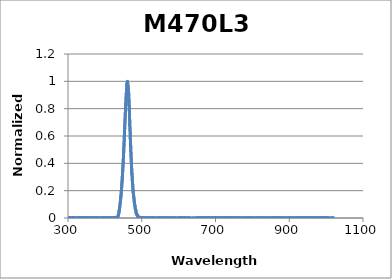
| Category | Normalized Intensity |
|---|---|
| 194.11 | 0.002 |
| 194.31 | -0.003 |
| 194.52 | 0 |
| 194.72 | -0.001 |
| 194.92 | 0.003 |
| 195.12 | 0.001 |
| 195.33 | 0.001 |
| 195.53 | -0.002 |
| 195.73 | -0.001 |
| 195.93 | 0.001 |
| 196.13 | 0.001 |
| 196.34 | 0.001 |
| 196.54 | -0.001 |
| 196.74 | 0.001 |
| 196.94 | 0 |
| 197.15 | 0.001 |
| 197.35 | 0.002 |
| 197.55 | -0.001 |
| 197.75 | -0.001 |
| 197.96 | 0 |
| 198.16 | 0.001 |
| 198.36 | 0 |
| 198.56 | 0 |
| 198.76 | 0.002 |
| 198.97 | 0.001 |
| 199.17 | -0.001 |
| 199.37 | 0.001 |
| 199.57 | 0 |
| 199.78 | 0.001 |
| 199.98 | -0.001 |
| 200.18 | -0.001 |
| 200.39 | 0 |
| 200.59 | 0.001 |
| 200.79 | 0 |
| 200.99 | -0.001 |
| 201.2 | -0.003 |
| 201.4 | 0.002 |
| 201.6 | -0.001 |
| 201.8 | 0 |
| 202.01 | -0.002 |
| 202.21 | -0.001 |
| 202.41 | -0.002 |
| 202.62 | -0.001 |
| 202.82 | -0.001 |
| 203.02 | -0.001 |
| 203.22 | -0.002 |
| 203.43 | 0 |
| 203.63 | -0.001 |
| 203.83 | 0 |
| 204.04 | -0.001 |
| 204.24 | 0 |
| 204.44 | -0.001 |
| 204.64 | 0.002 |
| 204.85 | -0.003 |
| 205.05 | 0.001 |
| 205.25 | -0.001 |
| 205.46 | 0 |
| 205.66 | 0 |
| 205.86 | 0.001 |
| 206.07 | 0 |
| 206.27 | 0.003 |
| 206.47 | -0.002 |
| 206.68 | -0.002 |
| 206.88 | 0 |
| 207.08 | 0.001 |
| 207.29 | 0 |
| 207.49 | -0.001 |
| 207.69 | -0.001 |
| 207.89 | 0 |
| 208.1 | -0.002 |
| 208.3 | 0 |
| 208.5 | -0.002 |
| 208.71 | 0.001 |
| 208.91 | 0 |
| 209.12 | 0.001 |
| 209.32 | -0.001 |
| 209.52 | -0.001 |
| 209.73 | 0 |
| 209.93 | 0.001 |
| 210.13 | 0 |
| 210.34 | 0 |
| 210.54 | -0.002 |
| 210.74 | 0.001 |
| 210.95 | -0.003 |
| 211.15 | -0.002 |
| 211.35 | -0.001 |
| 211.56 | 0.001 |
| 211.76 | -0.003 |
| 211.96 | -0.001 |
| 212.17 | -0.003 |
| 212.37 | -0.002 |
| 212.58 | 0 |
| 212.78 | -0.001 |
| 212.98 | -0.002 |
| 213.19 | -0.001 |
| 213.39 | -0.001 |
| 213.59 | 0.001 |
| 213.8 | -0.001 |
| 214.0 | -0.001 |
| 214.21 | 0 |
| 214.41 | -0.001 |
| 214.61 | -0.001 |
| 214.82 | 0.001 |
| 215.02 | -0.001 |
| 215.23 | 0.003 |
| 215.43 | 0.001 |
| 215.63 | -0.001 |
| 215.84 | 0 |
| 216.04 | 0.001 |
| 216.25 | -0.002 |
| 216.45 | -0.001 |
| 216.65 | -0.001 |
| 216.86 | 0 |
| 217.06 | 0.001 |
| 217.27 | -0.001 |
| 217.47 | -0.002 |
| 217.67 | 0.001 |
| 217.88 | -0.002 |
| 218.08 | 0 |
| 218.29 | -0.001 |
| 218.49 | -0.001 |
| 218.7 | 0 |
| 218.9 | 0.002 |
| 219.1 | -0.001 |
| 219.31 | -0.001 |
| 219.51 | 0 |
| 219.72 | 0 |
| 219.92 | -0.002 |
| 220.13 | 0.002 |
| 220.33 | 0 |
| 220.53 | -0.001 |
| 220.74 | -0.001 |
| 220.94 | -0.001 |
| 221.15 | -0.002 |
| 221.35 | 0 |
| 221.56 | -0.002 |
| 221.76 | 0 |
| 221.97 | -0.002 |
| 222.17 | 0.001 |
| 222.38 | -0.001 |
| 222.58 | 0 |
| 222.78 | 0.001 |
| 222.99 | 0.001 |
| 223.19 | -0.001 |
| 223.4 | -0.002 |
| 223.6 | -0.003 |
| 223.81 | 0.001 |
| 224.01 | -0.001 |
| 224.22 | 0 |
| 224.42 | 0.001 |
| 224.63 | -0.002 |
| 224.83 | -0.002 |
| 225.04 | 0 |
| 225.24 | -0.002 |
| 225.45 | 0 |
| 225.65 | -0.001 |
| 225.86 | 0 |
| 226.06 | -0.002 |
| 226.27 | 0.002 |
| 226.47 | -0.002 |
| 226.68 | 0.002 |
| 226.88 | 0 |
| 227.09 | -0.001 |
| 227.29 | -0.002 |
| 227.5 | -0.002 |
| 227.7 | 0 |
| 227.91 | 0.002 |
| 228.11 | -0.002 |
| 228.32 | -0.003 |
| 228.52 | -0.003 |
| 228.73 | 0 |
| 228.93 | -0.003 |
| 229.14 | 0.002 |
| 229.34 | 0 |
| 229.55 | 0.001 |
| 229.75 | -0.002 |
| 229.96 | 0 |
| 230.16 | -0.002 |
| 230.37 | 0 |
| 230.57 | -0.001 |
| 230.78 | 0.001 |
| 230.98 | -0.002 |
| 231.19 | 0 |
| 231.39 | 0.001 |
| 231.6 | -0.001 |
| 231.81 | -0.001 |
| 232.01 | -0.001 |
| 232.22 | 0.001 |
| 232.42 | 0 |
| 232.63 | 0 |
| 232.83 | 0.002 |
| 233.04 | 0 |
| 233.24 | 0 |
| 233.45 | 0 |
| 233.65 | 0 |
| 233.86 | -0.003 |
| 234.07 | -0.001 |
| 234.27 | -0.001 |
| 234.48 | 0 |
| 234.68 | 0 |
| 234.89 | 0.002 |
| 235.09 | 0.001 |
| 235.3 | 0.001 |
| 235.51 | -0.002 |
| 235.71 | -0.001 |
| 235.92 | 0 |
| 236.12 | 0 |
| 236.33 | -0.001 |
| 236.53 | -0.002 |
| 236.74 | -0.001 |
| 236.95 | 0.001 |
| 237.15 | 0 |
| 237.36 | -0.001 |
| 237.56 | 0.001 |
| 237.77 | -0.001 |
| 237.98 | -0.001 |
| 238.18 | 0 |
| 238.39 | -0.001 |
| 238.59 | 0 |
| 238.8 | -0.001 |
| 239.01 | 0.002 |
| 239.21 | 0 |
| 239.42 | 0 |
| 239.62 | 0 |
| 239.83 | 0.001 |
| 240.04 | 0.001 |
| 240.24 | 0.003 |
| 240.45 | 0.001 |
| 240.65 | 0 |
| 240.86 | 0 |
| 241.07 | 0.001 |
| 241.27 | -0.002 |
| 241.48 | 0 |
| 241.69 | -0.001 |
| 241.89 | 0 |
| 242.1 | -0.001 |
| 242.3 | 0 |
| 242.51 | 0.001 |
| 242.72 | 0 |
| 242.92 | -0.002 |
| 243.13 | 0.001 |
| 243.34 | -0.002 |
| 243.54 | 0 |
| 243.75 | 0 |
| 243.96 | -0.001 |
| 244.16 | -0.002 |
| 244.37 | 0 |
| 244.58 | 0.002 |
| 244.78 | 0.003 |
| 244.99 | -0.001 |
| 245.19 | 0.001 |
| 245.4 | 0.001 |
| 245.61 | -0.001 |
| 245.81 | -0.002 |
| 246.02 | 0 |
| 246.23 | 0.001 |
| 246.43 | 0 |
| 246.64 | 0 |
| 246.85 | -0.001 |
| 247.05 | -0.003 |
| 247.26 | 0.001 |
| 247.47 | -0.001 |
| 247.67 | -0.001 |
| 247.88 | 0 |
| 248.09 | 0.001 |
| 248.3 | 0 |
| 248.5 | 0 |
| 248.71 | -0.001 |
| 248.92 | 0.003 |
| 249.12 | -0.002 |
| 249.33 | -0.001 |
| 249.54 | -0.001 |
| 249.74 | 0.001 |
| 249.95 | 0.001 |
| 250.16 | 0.002 |
| 250.36 | -0.002 |
| 250.57 | 0.001 |
| 250.78 | -0.001 |
| 250.99 | 0.003 |
| 251.19 | -0.001 |
| 251.4 | 0 |
| 251.61 | -0.001 |
| 251.81 | 0.001 |
| 252.02 | -0.001 |
| 252.23 | -0.001 |
| 252.44 | 0 |
| 252.64 | 0.001 |
| 252.85 | -0.001 |
| 253.06 | 0 |
| 253.26 | 0.003 |
| 253.47 | 0.001 |
| 253.68 | 0 |
| 253.89 | 0.002 |
| 254.09 | -0.001 |
| 254.3 | 0.002 |
| 254.51 | -0.002 |
| 254.72 | 0.001 |
| 254.92 | -0.001 |
| 255.13 | -0.001 |
| 255.34 | 0.001 |
| 255.54 | 0.001 |
| 255.75 | -0.002 |
| 255.96 | 0.001 |
| 256.17 | 0.001 |
| 256.37 | 0.001 |
| 256.58 | -0.001 |
| 256.79 | -0.001 |
| 257.0 | -0.001 |
| 257.2 | -0.001 |
| 257.41 | -0.003 |
| 257.62 | -0.001 |
| 257.83 | -0.002 |
| 258.04 | -0.001 |
| 258.24 | -0.003 |
| 258.45 | 0.002 |
| 258.66 | -0.002 |
| 258.87 | 0 |
| 259.07 | 0 |
| 259.28 | 0.003 |
| 259.49 | -0.001 |
| 259.7 | 0.002 |
| 259.9 | 0 |
| 260.11 | -0.001 |
| 260.32 | 0 |
| 260.53 | 0 |
| 260.74 | -0.001 |
| 260.94 | 0.001 |
| 261.15 | -0.001 |
| 261.36 | 0.002 |
| 261.57 | -0.004 |
| 261.78 | 0 |
| 261.98 | -0.001 |
| 262.19 | 0.001 |
| 262.4 | 0 |
| 262.61 | 0.001 |
| 262.82 | -0.002 |
| 263.02 | 0 |
| 263.23 | -0.001 |
| 263.44 | 0.003 |
| 263.65 | -0.001 |
| 263.86 | -0.002 |
| 264.06 | -0.001 |
| 264.27 | 0.001 |
| 264.48 | 0 |
| 264.69 | 0.001 |
| 264.9 | 0 |
| 265.11 | 0 |
| 265.31 | 0.001 |
| 265.52 | -0.001 |
| 265.73 | -0.002 |
| 265.94 | 0 |
| 266.15 | 0 |
| 266.35 | -0.001 |
| 266.56 | -0.001 |
| 266.77 | 0.001 |
| 266.98 | -0.001 |
| 267.19 | 0 |
| 267.4 | -0.002 |
| 267.61 | 0 |
| 267.81 | 0 |
| 268.02 | 0 |
| 268.23 | -0.002 |
| 268.44 | 0.002 |
| 268.65 | 0.001 |
| 268.86 | 0.001 |
| 269.06 | -0.001 |
| 269.27 | -0.001 |
| 269.48 | -0.003 |
| 269.69 | 0.002 |
| 269.9 | -0.001 |
| 270.11 | 0.003 |
| 270.32 | -0.002 |
| 270.52 | 0 |
| 270.73 | 0.001 |
| 270.94 | 0 |
| 271.15 | 0.002 |
| 271.36 | 0 |
| 271.57 | 0 |
| 271.78 | -0.001 |
| 271.99 | 0.001 |
| 272.19 | 0 |
| 272.4 | 0 |
| 272.61 | -0.001 |
| 272.82 | -0.001 |
| 273.03 | 0 |
| 273.24 | 0 |
| 273.45 | 0.001 |
| 273.66 | -0.002 |
| 273.87 | -0.001 |
| 274.07 | -0.002 |
| 274.28 | -0.001 |
| 274.49 | -0.002 |
| 274.7 | -0.002 |
| 274.91 | 0 |
| 275.12 | -0.001 |
| 275.33 | -0.002 |
| 275.54 | 0.001 |
| 275.75 | -0.002 |
| 275.96 | -0.001 |
| 276.17 | -0.002 |
| 276.37 | 0 |
| 276.58 | -0.002 |
| 276.79 | 0.001 |
| 277.0 | -0.002 |
| 277.21 | 0.001 |
| 277.42 | -0.002 |
| 277.63 | 0 |
| 277.84 | -0.001 |
| 278.05 | 0.001 |
| 278.26 | 0.001 |
| 278.47 | 0.001 |
| 278.68 | 0 |
| 278.89 | 0.002 |
| 279.09 | -0.001 |
| 279.3 | -0.001 |
| 279.51 | 0.001 |
| 279.72 | 0 |
| 279.93 | 0 |
| 280.14 | 0 |
| 280.35 | 0 |
| 280.56 | 0 |
| 280.77 | 0.002 |
| 280.98 | 0 |
| 281.19 | 0 |
| 281.4 | -0.002 |
| 281.61 | 0.001 |
| 281.82 | 0.001 |
| 282.03 | -0.001 |
| 282.24 | -0.001 |
| 282.45 | 0 |
| 282.66 | 0.002 |
| 282.87 | -0.001 |
| 283.08 | -0.001 |
| 283.29 | 0.001 |
| 283.5 | 0.002 |
| 283.7 | -0.001 |
| 283.91 | -0.001 |
| 284.12 | 0.002 |
| 284.33 | 0.002 |
| 284.54 | 0 |
| 284.75 | -0.001 |
| 284.96 | 0.002 |
| 285.17 | 0.001 |
| 285.38 | -0.003 |
| 285.59 | 0.001 |
| 285.8 | -0.001 |
| 286.01 | 0.001 |
| 286.22 | 0 |
| 286.43 | 0 |
| 286.64 | 0 |
| 286.85 | 0.002 |
| 287.06 | -0.001 |
| 287.27 | -0.001 |
| 287.48 | 0.001 |
| 287.69 | 0.001 |
| 287.9 | 0 |
| 288.11 | 0.001 |
| 288.32 | -0.002 |
| 288.53 | 0 |
| 288.74 | 0 |
| 288.95 | 0.001 |
| 289.16 | 0.002 |
| 289.37 | 0 |
| 289.58 | -0.001 |
| 289.79 | 0.001 |
| 290.0 | -0.001 |
| 290.21 | 0 |
| 290.43 | -0.001 |
| 290.64 | -0.001 |
| 290.85 | -0.002 |
| 291.06 | -0.002 |
| 291.27 | -0.001 |
| 291.48 | 0.001 |
| 291.69 | 0 |
| 291.9 | 0 |
| 292.11 | -0.003 |
| 292.32 | 0 |
| 292.53 | -0.001 |
| 292.74 | 0.002 |
| 292.95 | 0 |
| 293.16 | 0.002 |
| 293.37 | 0 |
| 293.58 | 0.002 |
| 293.79 | -0.001 |
| 294.0 | 0 |
| 294.21 | -0.001 |
| 294.42 | 0 |
| 294.63 | 0 |
| 294.84 | 0.001 |
| 295.06 | -0.002 |
| 295.27 | 0 |
| 295.48 | -0.001 |
| 295.69 | -0.001 |
| 295.9 | 0.002 |
| 296.11 | 0 |
| 296.32 | -0.001 |
| 296.53 | -0.001 |
| 296.74 | -0.001 |
| 296.95 | 0.001 |
| 297.16 | -0.003 |
| 297.37 | -0.002 |
| 297.58 | -0.001 |
| 297.79 | -0.001 |
| 298.01 | -0.001 |
| 298.22 | 0 |
| 298.43 | -0.002 |
| 298.64 | 0 |
| 298.85 | -0.001 |
| 299.06 | 0.003 |
| 299.27 | 0 |
| 299.48 | 0.001 |
| 299.69 | -0.001 |
| 299.9 | 0 |
| 300.12 | -0.003 |
| 300.33 | 0.002 |
| 300.54 | -0.001 |
| 300.75 | -0.002 |
| 300.96 | 0.001 |
| 301.17 | 0.002 |
| 301.38 | 0.001 |
| 301.59 | 0.002 |
| 301.8 | -0.003 |
| 302.02 | 0.001 |
| 302.23 | 0 |
| 302.44 | 0 |
| 302.65 | -0.001 |
| 302.86 | 0 |
| 303.07 | -0.002 |
| 303.28 | 0.001 |
| 303.49 | 0 |
| 303.71 | 0.001 |
| 303.92 | 0 |
| 304.13 | 0.003 |
| 304.34 | -0.001 |
| 304.55 | 0.001 |
| 304.76 | -0.001 |
| 304.97 | -0.001 |
| 305.18 | -0.003 |
| 305.4 | 0.002 |
| 305.61 | -0.001 |
| 305.82 | 0 |
| 306.03 | 0 |
| 306.24 | 0 |
| 306.45 | -0.001 |
| 306.67 | 0.003 |
| 306.88 | -0.001 |
| 307.09 | 0.002 |
| 307.3 | -0.001 |
| 307.51 | 0.001 |
| 307.72 | 0 |
| 307.93 | 0.001 |
| 308.15 | -0.001 |
| 308.36 | 0.001 |
| 308.57 | 0 |
| 308.78 | -0.001 |
| 308.99 | 0 |
| 309.21 | -0.001 |
| 309.42 | -0.001 |
| 309.63 | 0 |
| 309.84 | -0.002 |
| 310.05 | 0.002 |
| 310.26 | 0 |
| 310.48 | 0.002 |
| 310.69 | 0 |
| 310.9 | 0 |
| 311.11 | 0 |
| 311.32 | 0.003 |
| 311.54 | -0.001 |
| 311.75 | 0.001 |
| 311.96 | 0 |
| 312.17 | 0.002 |
| 312.38 | 0.001 |
| 312.6 | 0.002 |
| 312.81 | 0 |
| 313.02 | 0 |
| 313.23 | -0.003 |
| 313.44 | -0.001 |
| 313.66 | -0.002 |
| 313.87 | 0.001 |
| 314.08 | 0 |
| 314.29 | 0.005 |
| 314.5 | 0 |
| 314.72 | 0 |
| 314.93 | -0.002 |
| 315.14 | 0 |
| 315.35 | -0.001 |
| 315.56 | 0.001 |
| 315.78 | -0.001 |
| 315.99 | -0.002 |
| 316.2 | -0.002 |
| 316.41 | 0.003 |
| 316.63 | -0.001 |
| 316.84 | 0.002 |
| 317.05 | -0.003 |
| 317.26 | 0 |
| 317.48 | -0.001 |
| 317.69 | 0.002 |
| 317.9 | 0 |
| 318.11 | 0.002 |
| 318.33 | -0.002 |
| 318.54 | 0 |
| 318.75 | 0.001 |
| 318.96 | 0.001 |
| 319.17 | -0.001 |
| 319.39 | 0.001 |
| 319.6 | -0.002 |
| 319.81 | -0.001 |
| 320.03 | -0.001 |
| 320.24 | 0.002 |
| 320.45 | 0 |
| 320.66 | -0.001 |
| 320.88 | -0.001 |
| 321.09 | 0.001 |
| 321.3 | 0 |
| 321.51 | 0.002 |
| 321.73 | 0 |
| 321.94 | 0.001 |
| 322.15 | -0.002 |
| 322.36 | 0 |
| 322.58 | -0.002 |
| 322.79 | 0.001 |
| 323.0 | 0 |
| 323.22 | 0 |
| 323.43 | -0.002 |
| 323.64 | 0.001 |
| 323.85 | 0 |
| 324.07 | 0.001 |
| 324.28 | -0.001 |
| 324.49 | -0.001 |
| 324.71 | -0.001 |
| 324.92 | -0.002 |
| 325.13 | 0.001 |
| 325.34 | 0 |
| 325.56 | -0.001 |
| 325.77 | 0 |
| 325.98 | -0.003 |
| 326.2 | 0.001 |
| 326.41 | -0.001 |
| 326.62 | 0 |
| 326.84 | -0.003 |
| 327.05 | 0.002 |
| 327.26 | -0.002 |
| 327.47 | 0 |
| 327.69 | -0.002 |
| 327.9 | 0 |
| 328.11 | -0.001 |
| 328.33 | 0 |
| 328.54 | -0.002 |
| 328.75 | 0.001 |
| 328.97 | -0.002 |
| 329.18 | 0 |
| 329.39 | 0 |
| 329.61 | 0 |
| 329.82 | -0.001 |
| 330.03 | 0.001 |
| 330.25 | 0.001 |
| 330.46 | 0.002 |
| 330.67 | 0 |
| 330.89 | 0.001 |
| 331.1 | 0.001 |
| 331.31 | -0.001 |
| 331.53 | -0.001 |
| 331.74 | 0.001 |
| 331.95 | -0.002 |
| 332.17 | -0.001 |
| 332.38 | 0.001 |
| 332.59 | 0.003 |
| 332.81 | 0.001 |
| 333.02 | 0 |
| 333.24 | -0.002 |
| 333.45 | 0.001 |
| 333.66 | 0.001 |
| 333.88 | -0.001 |
| 334.09 | 0 |
| 334.3 | 0.001 |
| 334.52 | -0.001 |
| 334.73 | 0.001 |
| 334.94 | 0.001 |
| 335.16 | 0 |
| 335.37 | 0 |
| 335.59 | 0 |
| 335.8 | 0.001 |
| 336.01 | -0.001 |
| 336.23 | 0.001 |
| 336.44 | -0.002 |
| 336.65 | -0.003 |
| 336.87 | 0 |
| 337.08 | 0 |
| 337.3 | 0 |
| 337.51 | -0.002 |
| 337.72 | 0.001 |
| 337.94 | -0.002 |
| 338.15 | 0.001 |
| 338.37 | 0.001 |
| 338.58 | 0.001 |
| 338.79 | -0.003 |
| 339.01 | 0.002 |
| 339.22 | 0 |
| 339.44 | 0 |
| 339.65 | 0 |
| 339.86 | 0.001 |
| 340.08 | -0.002 |
| 340.29 | 0.001 |
| 340.51 | -0.001 |
| 340.72 | 0.001 |
| 340.93 | -0.001 |
| 341.15 | 0.001 |
| 341.36 | -0.001 |
| 341.58 | 0 |
| 341.79 | -0.001 |
| 342.0 | 0 |
| 342.22 | -0.001 |
| 342.43 | 0.001 |
| 342.65 | -0.001 |
| 342.86 | -0.002 |
| 343.08 | 0 |
| 343.29 | 0 |
| 343.5 | 0 |
| 343.72 | 0 |
| 343.93 | -0.003 |
| 344.15 | 0.001 |
| 344.36 | -0.002 |
| 344.58 | 0.002 |
| 344.79 | -0.003 |
| 345.0 | 0 |
| 345.22 | 0.001 |
| 345.43 | 0 |
| 345.65 | 0.001 |
| 345.86 | 0.001 |
| 346.08 | -0.002 |
| 346.29 | 0 |
| 346.51 | -0.001 |
| 346.72 | -0.001 |
| 346.94 | -0.001 |
| 347.15 | 0 |
| 347.36 | -0.001 |
| 347.58 | 0.001 |
| 347.79 | -0.001 |
| 348.01 | 0.003 |
| 348.22 | 0 |
| 348.44 | 0 |
| 348.65 | -0.002 |
| 348.87 | 0 |
| 349.08 | 0 |
| 349.3 | -0.001 |
| 349.51 | -0.001 |
| 349.73 | 0 |
| 349.94 | -0.002 |
| 350.16 | 0.001 |
| 350.37 | 0.001 |
| 350.59 | -0.001 |
| 350.8 | -0.001 |
| 351.01 | 0.001 |
| 351.23 | -0.003 |
| 351.44 | -0.001 |
| 351.66 | -0.002 |
| 351.87 | 0.003 |
| 352.09 | -0.001 |
| 352.3 | 0 |
| 352.52 | 0.001 |
| 352.73 | 0 |
| 352.95 | 0.001 |
| 353.16 | 0 |
| 353.38 | -0.002 |
| 353.59 | 0.002 |
| 353.81 | -0.004 |
| 354.02 | 0 |
| 354.24 | -0.001 |
| 354.45 | 0 |
| 354.67 | -0.002 |
| 354.88 | -0.002 |
| 355.1 | -0.001 |
| 355.32 | 0.002 |
| 355.53 | 0.001 |
| 355.75 | 0 |
| 355.96 | -0.002 |
| 356.18 | 0 |
| 356.39 | 0 |
| 356.61 | 0.002 |
| 356.82 | -0.002 |
| 357.04 | 0.001 |
| 357.25 | -0.001 |
| 357.47 | 0.001 |
| 357.68 | -0.001 |
| 357.9 | -0.001 |
| 358.11 | -0.003 |
| 358.33 | -0.001 |
| 358.54 | -0.001 |
| 358.76 | 0 |
| 358.98 | -0.001 |
| 359.19 | 0.002 |
| 359.41 | -0.001 |
| 359.62 | 0 |
| 359.84 | -0.001 |
| 360.05 | 0.002 |
| 360.27 | -0.002 |
| 360.48 | 0.002 |
| 360.7 | -0.001 |
| 360.91 | -0.001 |
| 361.13 | -0.001 |
| 361.35 | -0.001 |
| 361.56 | 0.001 |
| 361.78 | 0 |
| 361.99 | 0 |
| 362.21 | 0.001 |
| 362.42 | 0 |
| 362.64 | 0.001 |
| 362.86 | 0 |
| 363.07 | 0 |
| 363.29 | -0.002 |
| 363.5 | 0.001 |
| 363.72 | 0.001 |
| 363.93 | 0 |
| 364.15 | -0.003 |
| 364.37 | 0 |
| 364.58 | -0.001 |
| 364.8 | 0.002 |
| 365.01 | 0 |
| 365.23 | 0.002 |
| 365.45 | -0.001 |
| 365.66 | 0.001 |
| 365.88 | -0.002 |
| 366.09 | 0 |
| 366.31 | -0.001 |
| 366.53 | -0.001 |
| 366.74 | -0.001 |
| 366.96 | 0.001 |
| 367.17 | -0.001 |
| 367.39 | -0.001 |
| 367.61 | -0.003 |
| 367.82 | 0.001 |
| 368.04 | 0.001 |
| 368.25 | 0 |
| 368.47 | -0.002 |
| 368.69 | 0.001 |
| 368.9 | 0.001 |
| 369.12 | 0.001 |
| 369.33 | -0.001 |
| 369.55 | 0 |
| 369.77 | -0.001 |
| 369.98 | 0.001 |
| 370.2 | 0 |
| 370.41 | 0.001 |
| 370.63 | -0.001 |
| 370.85 | 0 |
| 371.06 | 0 |
| 371.28 | -0.001 |
| 371.5 | -0.001 |
| 371.71 | -0.001 |
| 371.93 | -0.001 |
| 372.15 | 0.001 |
| 372.36 | -0.002 |
| 372.58 | 0 |
| 372.79 | -0.001 |
| 373.01 | 0.002 |
| 373.23 | 0 |
| 373.44 | 0.001 |
| 373.66 | -0.001 |
| 373.88 | 0.001 |
| 374.09 | 0.001 |
| 374.31 | 0.001 |
| 374.53 | -0.001 |
| 374.74 | 0.002 |
| 374.96 | -0.002 |
| 375.18 | 0.001 |
| 375.39 | -0.001 |
| 375.61 | 0.001 |
| 375.83 | -0.001 |
| 376.04 | 0.001 |
| 376.26 | -0.001 |
| 376.48 | 0.002 |
| 376.69 | 0.001 |
| 376.91 | 0 |
| 377.13 | -0.001 |
| 377.34 | 0 |
| 377.56 | 0.002 |
| 377.78 | 0.001 |
| 377.99 | -0.001 |
| 378.21 | 0.003 |
| 378.43 | -0.001 |
| 378.64 | 0.001 |
| 378.86 | -0.001 |
| 379.08 | 0.001 |
| 379.29 | -0.002 |
| 379.51 | 0 |
| 379.73 | 0.001 |
| 379.94 | 0.001 |
| 380.16 | -0.003 |
| 380.38 | 0.001 |
| 380.6 | -0.001 |
| 380.81 | -0.001 |
| 381.03 | -0.001 |
| 381.25 | 0 |
| 381.46 | -0.003 |
| 381.68 | 0 |
| 381.9 | 0 |
| 382.11 | -0.001 |
| 382.33 | -0.002 |
| 382.55 | 0 |
| 382.77 | -0.001 |
| 382.98 | 0.001 |
| 383.2 | -0.002 |
| 383.42 | 0 |
| 383.63 | -0.001 |
| 383.85 | 0.001 |
| 384.07 | -0.003 |
| 384.29 | -0.001 |
| 384.5 | 0 |
| 384.72 | 0.002 |
| 384.94 | -0.001 |
| 385.15 | 0 |
| 385.37 | 0 |
| 385.59 | 0 |
| 385.81 | 0.001 |
| 386.02 | 0 |
| 386.24 | 0.002 |
| 386.46 | 0 |
| 386.68 | -0.001 |
| 386.89 | 0.001 |
| 387.11 | -0.002 |
| 387.33 | 0 |
| 387.55 | -0.001 |
| 387.76 | -0.001 |
| 387.98 | 0.001 |
| 388.2 | -0.002 |
| 388.42 | -0.002 |
| 388.63 | -0.002 |
| 388.85 | 0.001 |
| 389.07 | -0.002 |
| 389.29 | -0.002 |
| 389.5 | -0.001 |
| 389.72 | -0.002 |
| 389.94 | -0.001 |
| 390.16 | -0.002 |
| 390.37 | 0 |
| 390.59 | -0.002 |
| 390.81 | 0 |
| 391.03 | -0.001 |
| 391.24 | 0 |
| 391.46 | -0.001 |
| 391.68 | 0.001 |
| 391.9 | 0 |
| 392.11 | 0.001 |
| 392.33 | -0.002 |
| 392.55 | 0 |
| 392.77 | -0.001 |
| 392.99 | 0.001 |
| 393.2 | -0.001 |
| 393.42 | 0 |
| 393.64 | -0.001 |
| 393.86 | 0.001 |
| 394.07 | 0 |
| 394.29 | -0.001 |
| 394.51 | -0.001 |
| 394.73 | 0.001 |
| 394.95 | -0.001 |
| 395.16 | 0.001 |
| 395.38 | -0.001 |
| 395.6 | 0.002 |
| 395.82 | -0.002 |
| 396.04 | 0.002 |
| 396.25 | -0.003 |
| 396.47 | 0.001 |
| 396.69 | 0.001 |
| 396.91 | 0.002 |
| 397.13 | -0.001 |
| 397.34 | 0 |
| 397.56 | 0 |
| 397.78 | 0.001 |
| 398.0 | -0.001 |
| 398.22 | -0.001 |
| 398.44 | -0.002 |
| 398.65 | 0 |
| 398.87 | 0 |
| 399.09 | 0.001 |
| 399.31 | 0 |
| 399.53 | -0.001 |
| 399.74 | -0.002 |
| 399.96 | -0.001 |
| 400.18 | 0.002 |
| 400.4 | -0.001 |
| 400.62 | 0 |
| 400.84 | 0.001 |
| 401.05 | -0.002 |
| 401.27 | 0 |
| 401.49 | -0.001 |
| 401.71 | 0.002 |
| 401.93 | -0.002 |
| 402.15 | 0.001 |
| 402.36 | -0.001 |
| 402.58 | 0 |
| 402.8 | -0.003 |
| 403.02 | 0.002 |
| 403.24 | -0.001 |
| 403.46 | 0 |
| 403.68 | 0.004 |
| 403.89 | -0.003 |
| 404.11 | 0.003 |
| 404.33 | 0.001 |
| 404.55 | -0.001 |
| 404.77 | -0.001 |
| 404.99 | 0 |
| 405.21 | -0.003 |
| 405.42 | -0.001 |
| 405.64 | 0 |
| 405.86 | 0.001 |
| 406.08 | -0.001 |
| 406.3 | 0 |
| 406.52 | -0.001 |
| 406.74 | 0.001 |
| 406.95 | 0 |
| 407.17 | -0.002 |
| 407.39 | -0.001 |
| 407.61 | 0.002 |
| 407.83 | -0.004 |
| 408.05 | 0 |
| 408.27 | 0 |
| 408.49 | 0.002 |
| 408.71 | -0.002 |
| 408.92 | 0.001 |
| 409.14 | -0.002 |
| 409.36 | 0.002 |
| 409.58 | -0.003 |
| 409.8 | 0.001 |
| 410.02 | 0 |
| 410.24 | -0.001 |
| 410.46 | -0.002 |
| 410.68 | 0.002 |
| 410.89 | -0.001 |
| 411.11 | -0.001 |
| 411.33 | -0.002 |
| 411.55 | -0.001 |
| 411.77 | -0.001 |
| 411.99 | 0.001 |
| 412.21 | -0.001 |
| 412.43 | -0.001 |
| 412.65 | -0.003 |
| 412.87 | -0.002 |
| 413.08 | -0.002 |
| 413.3 | 0.001 |
| 413.52 | 0 |
| 413.74 | 0.001 |
| 413.96 | -0.001 |
| 414.18 | 0.001 |
| 414.4 | -0.001 |
| 414.62 | 0.002 |
| 414.84 | -0.001 |
| 415.06 | -0.003 |
| 415.28 | 0.001 |
| 415.5 | 0.003 |
| 415.72 | 0.002 |
| 415.93 | -0.001 |
| 416.15 | 0.001 |
| 416.37 | -0.001 |
| 416.59 | -0.003 |
| 416.81 | 0.001 |
| 417.03 | -0.001 |
| 417.25 | 0.001 |
| 417.47 | 0.001 |
| 417.69 | 0 |
| 417.91 | 0 |
| 418.13 | 0 |
| 418.35 | -0.003 |
| 418.57 | 0 |
| 418.79 | -0.001 |
| 419.01 | 0 |
| 419.23 | 0 |
| 419.45 | 0.001 |
| 419.67 | 0.001 |
| 419.89 | 0.001 |
| 420.1 | -0.001 |
| 420.32 | 0 |
| 420.54 | -0.001 |
| 420.76 | 0 |
| 420.98 | 0 |
| 421.2 | 0 |
| 421.42 | 0 |
| 421.64 | 0 |
| 421.86 | -0.001 |
| 422.08 | 0.001 |
| 422.3 | -0.001 |
| 422.52 | -0.001 |
| 422.74 | -0.002 |
| 422.96 | 0 |
| 423.18 | -0.001 |
| 423.4 | 0 |
| 423.62 | -0.002 |
| 423.84 | -0.001 |
| 424.06 | -0.001 |
| 424.28 | 0.002 |
| 424.5 | 0 |
| 424.72 | 0.003 |
| 424.94 | 0.001 |
| 425.16 | 0.001 |
| 425.38 | -0.001 |
| 425.6 | 0 |
| 425.82 | -0.001 |
| 426.04 | -0.001 |
| 426.26 | 0 |
| 426.48 | -0.002 |
| 426.7 | -0.002 |
| 426.92 | 0 |
| 427.14 | 0.001 |
| 427.36 | 0.001 |
| 427.58 | 0 |
| 427.8 | 0.002 |
| 428.02 | -0.002 |
| 428.24 | -0.001 |
| 428.46 | 0.001 |
| 428.68 | 0.001 |
| 428.9 | 0.002 |
| 429.12 | 0.001 |
| 429.34 | -0.001 |
| 429.56 | 0.001 |
| 429.78 | -0.001 |
| 430.0 | -0.001 |
| 430.22 | 0 |
| 430.44 | 0.001 |
| 430.66 | 0 |
| 430.88 | -0.001 |
| 431.1 | 0 |
| 431.32 | 0.002 |
| 431.54 | -0.002 |
| 431.76 | 0.001 |
| 431.98 | 0.003 |
| 432.2 | 0 |
| 432.42 | 0.001 |
| 432.64 | 0.001 |
| 432.87 | 0.003 |
| 433.09 | 0.001 |
| 433.31 | 0.001 |
| 433.53 | 0.003 |
| 433.75 | 0.004 |
| 433.97 | 0.005 |
| 434.19 | 0.005 |
| 434.41 | 0.004 |
| 434.63 | 0.007 |
| 434.85 | 0.006 |
| 435.07 | 0.009 |
| 435.29 | 0.012 |
| 435.51 | 0.012 |
| 435.73 | 0.01 |
| 435.95 | 0.015 |
| 436.17 | 0.014 |
| 436.39 | 0.021 |
| 436.61 | 0.021 |
| 436.83 | 0.024 |
| 437.06 | 0.021 |
| 437.28 | 0.03 |
| 437.5 | 0.03 |
| 437.72 | 0.037 |
| 437.94 | 0.038 |
| 438.16 | 0.043 |
| 438.38 | 0.041 |
| 438.6 | 0.052 |
| 438.82 | 0.053 |
| 439.04 | 0.06 |
| 439.26 | 0.055 |
| 439.48 | 0.066 |
| 439.7 | 0.068 |
| 439.93 | 0.076 |
| 440.15 | 0.078 |
| 440.37 | 0.085 |
| 440.59 | 0.087 |
| 440.81 | 0.095 |
| 441.03 | 0.096 |
| 441.25 | 0.104 |
| 441.47 | 0.11 |
| 441.69 | 0.12 |
| 441.91 | 0.121 |
| 442.13 | 0.126 |
| 442.36 | 0.124 |
| 442.58 | 0.134 |
| 442.8 | 0.141 |
| 443.02 | 0.149 |
| 443.24 | 0.154 |
| 443.46 | 0.164 |
| 443.68 | 0.16 |
| 443.9 | 0.173 |
| 444.12 | 0.178 |
| 444.35 | 0.19 |
| 444.57 | 0.194 |
| 444.79 | 0.203 |
| 445.01 | 0.21 |
| 445.23 | 0.221 |
| 445.45 | 0.222 |
| 445.67 | 0.239 |
| 445.89 | 0.241 |
| 446.12 | 0.253 |
| 446.34 | 0.254 |
| 446.56 | 0.272 |
| 446.78 | 0.271 |
| 447.0 | 0.286 |
| 447.22 | 0.286 |
| 447.44 | 0.305 |
| 447.66 | 0.315 |
| 447.89 | 0.326 |
| 448.11 | 0.337 |
| 448.33 | 0.341 |
| 448.55 | 0.348 |
| 448.77 | 0.368 |
| 448.99 | 0.375 |
| 449.21 | 0.39 |
| 449.44 | 0.391 |
| 449.66 | 0.414 |
| 449.88 | 0.418 |
| 450.1 | 0.432 |
| 450.32 | 0.442 |
| 450.54 | 0.464 |
| 450.76 | 0.47 |
| 450.99 | 0.489 |
| 451.21 | 0.503 |
| 451.43 | 0.518 |
| 451.65 | 0.524 |
| 451.87 | 0.543 |
| 452.09 | 0.544 |
| 452.32 | 0.568 |
| 452.54 | 0.577 |
| 452.76 | 0.592 |
| 452.98 | 0.61 |
| 453.2 | 0.621 |
| 453.42 | 0.629 |
| 453.65 | 0.654 |
| 453.87 | 0.665 |
| 454.09 | 0.682 |
| 454.31 | 0.692 |
| 454.53 | 0.702 |
| 454.75 | 0.721 |
| 454.98 | 0.734 |
| 455.2 | 0.745 |
| 455.42 | 0.765 |
| 455.64 | 0.774 |
| 455.86 | 0.779 |
| 456.09 | 0.794 |
| 456.31 | 0.82 |
| 456.53 | 0.835 |
| 456.75 | 0.833 |
| 456.97 | 0.849 |
| 457.19 | 0.869 |
| 457.42 | 0.874 |
| 457.64 | 0.887 |
| 457.86 | 0.9 |
| 458.08 | 0.915 |
| 458.3 | 0.911 |
| 458.53 | 0.928 |
| 458.75 | 0.94 |
| 458.97 | 0.944 |
| 459.19 | 0.953 |
| 459.41 | 0.965 |
| 459.64 | 0.983 |
| 459.86 | 0.983 |
| 460.08 | 0.984 |
| 460.3 | 0.984 |
| 460.53 | 0.992 |
| 460.75 | 0.997 |
| 460.97 | 0.996 |
| 461.19 | 0.989 |
| 461.41 | 1 |
| 461.64 | 0.987 |
| 461.86 | 0.992 |
| 462.08 | 0.988 |
| 462.3 | 0.977 |
| 462.53 | 0.968 |
| 462.75 | 0.956 |
| 462.97 | 0.962 |
| 463.19 | 0.963 |
| 463.41 | 0.944 |
| 463.64 | 0.946 |
| 463.86 | 0.92 |
| 464.08 | 0.934 |
| 464.3 | 0.914 |
| 464.53 | 0.914 |
| 464.75 | 0.881 |
| 464.97 | 0.877 |
| 465.19 | 0.864 |
| 465.42 | 0.844 |
| 465.64 | 0.837 |
| 465.86 | 0.818 |
| 466.08 | 0.794 |
| 466.31 | 0.792 |
| 466.53 | 0.772 |
| 466.75 | 0.755 |
| 466.97 | 0.727 |
| 467.2 | 0.718 |
| 467.42 | 0.699 |
| 467.64 | 0.691 |
| 467.86 | 0.662 |
| 468.09 | 0.658 |
| 468.31 | 0.636 |
| 468.53 | 0.631 |
| 468.75 | 0.597 |
| 468.98 | 0.597 |
| 469.2 | 0.569 |
| 469.42 | 0.553 |
| 469.64 | 0.536 |
| 469.87 | 0.53 |
| 470.09 | 0.506 |
| 470.31 | 0.501 |
| 470.54 | 0.48 |
| 470.76 | 0.461 |
| 470.98 | 0.457 |
| 471.2 | 0.442 |
| 471.43 | 0.429 |
| 471.65 | 0.414 |
| 471.87 | 0.406 |
| 472.09 | 0.389 |
| 472.32 | 0.375 |
| 472.54 | 0.365 |
| 472.76 | 0.354 |
| 472.99 | 0.351 |
| 473.21 | 0.324 |
| 473.43 | 0.33 |
| 473.65 | 0.308 |
| 473.88 | 0.308 |
| 474.1 | 0.292 |
| 474.32 | 0.284 |
| 474.55 | 0.27 |
| 474.77 | 0.27 |
| 474.99 | 0.256 |
| 475.22 | 0.252 |
| 475.44 | 0.238 |
| 475.66 | 0.237 |
| 475.88 | 0.218 |
| 476.11 | 0.216 |
| 476.33 | 0.205 |
| 476.55 | 0.199 |
| 476.78 | 0.185 |
| 477.0 | 0.187 |
| 477.22 | 0.178 |
| 477.45 | 0.176 |
| 477.67 | 0.166 |
| 477.89 | 0.169 |
| 478.12 | 0.157 |
| 478.34 | 0.154 |
| 478.56 | 0.148 |
| 478.79 | 0.147 |
| 479.01 | 0.136 |
| 479.23 | 0.133 |
| 479.46 | 0.128 |
| 479.68 | 0.125 |
| 479.9 | 0.112 |
| 480.13 | 0.115 |
| 480.35 | 0.11 |
| 480.57 | 0.107 |
| 480.8 | 0.096 |
| 481.02 | 0.095 |
| 481.24 | 0.09 |
| 481.47 | 0.094 |
| 481.69 | 0.083 |
| 481.91 | 0.083 |
| 482.14 | 0.075 |
| 482.36 | 0.074 |
| 482.58 | 0.065 |
| 482.81 | 0.072 |
| 483.03 | 0.061 |
| 483.25 | 0.066 |
| 483.48 | 0.056 |
| 483.7 | 0.06 |
| 483.92 | 0.053 |
| 484.15 | 0.056 |
| 484.37 | 0.049 |
| 484.59 | 0.045 |
| 484.82 | 0.042 |
| 485.04 | 0.044 |
| 485.26 | 0.03 |
| 485.49 | 0.042 |
| 485.71 | 0.032 |
| 485.94 | 0.034 |
| 486.16 | 0.028 |
| 486.38 | 0.028 |
| 486.61 | 0.024 |
| 486.83 | 0.027 |
| 487.05 | 0.022 |
| 487.28 | 0.026 |
| 487.5 | 0.019 |
| 487.73 | 0.022 |
| 487.95 | 0.015 |
| 488.17 | 0.017 |
| 488.4 | 0.015 |
| 488.62 | 0.015 |
| 488.84 | 0.012 |
| 489.07 | 0.015 |
| 489.29 | 0.011 |
| 489.52 | 0.013 |
| 489.74 | 0.01 |
| 489.96 | 0.012 |
| 490.19 | 0.011 |
| 490.41 | 0.008 |
| 490.64 | 0.009 |
| 490.86 | 0.007 |
| 491.08 | 0.009 |
| 491.31 | 0.007 |
| 491.53 | 0.006 |
| 491.76 | 0.005 |
| 491.98 | 0.006 |
| 492.2 | 0.005 |
| 492.43 | 0.007 |
| 492.65 | 0.002 |
| 492.88 | 0.003 |
| 493.1 | 0.005 |
| 493.32 | 0.004 |
| 493.55 | 0.001 |
| 493.77 | 0.004 |
| 494.0 | 0.004 |
| 494.22 | 0.002 |
| 494.44 | 0.002 |
| 494.67 | 0.001 |
| 494.89 | 0.003 |
| 495.12 | 0.004 |
| 495.34 | 0.001 |
| 495.56 | 0.005 |
| 495.79 | 0.002 |
| 496.01 | 0.002 |
| 496.24 | 0.002 |
| 496.46 | 0.003 |
| 496.69 | 0.003 |
| 496.91 | 0.003 |
| 497.13 | 0.001 |
| 497.36 | 0 |
| 497.58 | 0.003 |
| 497.81 | 0.001 |
| 498.03 | 0.001 |
| 498.26 | -0.001 |
| 498.48 | 0.002 |
| 498.71 | 0 |
| 498.93 | -0.001 |
| 499.15 | 0.002 |
| 499.38 | 0 |
| 499.6 | 0.003 |
| 499.83 | -0.001 |
| 500.05 | 0.001 |
| 500.28 | -0.001 |
| 500.5 | 0.001 |
| 500.73 | 0 |
| 500.95 | 0.002 |
| 501.17 | -0.002 |
| 501.4 | 0.001 |
| 501.62 | 0 |
| 501.85 | 0.001 |
| 502.07 | -0.001 |
| 502.3 | 0.001 |
| 502.52 | 0 |
| 502.75 | 0 |
| 502.97 | 0 |
| 503.2 | 0.002 |
| 503.42 | 0.001 |
| 503.64 | -0.001 |
| 503.87 | 0.001 |
| 504.09 | -0.002 |
| 504.32 | -0.001 |
| 504.54 | -0.002 |
| 504.77 | 0 |
| 504.99 | 0.002 |
| 505.22 | -0.003 |
| 505.44 | 0 |
| 505.67 | -0.002 |
| 505.89 | 0 |
| 506.12 | 0 |
| 506.34 | 0.002 |
| 506.57 | -0.002 |
| 506.79 | -0.002 |
| 507.02 | -0.001 |
| 507.24 | 0 |
| 507.47 | 0.001 |
| 507.69 | -0.001 |
| 507.92 | -0.001 |
| 508.14 | 0.001 |
| 508.37 | 0 |
| 508.59 | 0 |
| 508.82 | -0.001 |
| 509.04 | 0 |
| 509.27 | 0 |
| 509.49 | 0 |
| 509.72 | 0 |
| 509.94 | 0 |
| 510.17 | 0 |
| 510.39 | 0 |
| 510.62 | -0.002 |
| 510.84 | -0.001 |
| 511.07 | 0 |
| 511.29 | 0 |
| 511.52 | -0.003 |
| 511.74 | 0.002 |
| 511.97 | 0 |
| 512.19 | -0.002 |
| 512.42 | -0.001 |
| 512.64 | 0 |
| 512.87 | -0.001 |
| 513.09 | 0.001 |
| 513.32 | 0 |
| 513.54 | 0.001 |
| 513.77 | -0.003 |
| 513.99 | 0 |
| 514.22 | -0.001 |
| 514.44 | 0 |
| 514.67 | -0.001 |
| 514.89 | 0 |
| 515.12 | 0 |
| 515.34 | 0.001 |
| 515.57 | -0.003 |
| 515.8 | 0.001 |
| 516.02 | 0.001 |
| 516.25 | 0 |
| 516.47 | -0.001 |
| 516.7 | 0 |
| 516.92 | 0.001 |
| 517.15 | 0 |
| 517.37 | 0 |
| 517.6 | -0.002 |
| 517.82 | 0 |
| 518.05 | 0 |
| 518.27 | 0.002 |
| 518.5 | -0.001 |
| 518.73 | 0 |
| 518.95 | -0.002 |
| 519.18 | 0.002 |
| 519.4 | 0.002 |
| 519.63 | 0 |
| 519.85 | -0.001 |
| 520.08 | 0.003 |
| 520.3 | 0.001 |
| 520.53 | 0.002 |
| 520.76 | -0.001 |
| 520.98 | -0.001 |
| 521.21 | -0.001 |
| 521.43 | 0.001 |
| 521.66 | -0.002 |
| 521.88 | 0.001 |
| 522.11 | -0.002 |
| 522.34 | 0 |
| 522.56 | -0.001 |
| 522.79 | 0.001 |
| 523.01 | 0 |
| 523.24 | 0 |
| 523.46 | 0.001 |
| 523.69 | 0 |
| 523.92 | -0.001 |
| 524.14 | 0 |
| 524.37 | -0.002 |
| 524.59 | 0 |
| 524.82 | -0.001 |
| 525.05 | -0.001 |
| 525.27 | -0.002 |
| 525.5 | -0.001 |
| 525.72 | 0 |
| 525.95 | 0.001 |
| 526.17 | -0.001 |
| 526.4 | 0.001 |
| 526.63 | -0.002 |
| 526.85 | 0.002 |
| 527.08 | -0.002 |
| 527.3 | 0.002 |
| 527.53 | -0.002 |
| 527.76 | 0.001 |
| 527.98 | -0.001 |
| 528.21 | 0 |
| 528.43 | 0 |
| 528.66 | -0.001 |
| 528.89 | 0 |
| 529.11 | 0 |
| 529.34 | 0 |
| 529.56 | -0.001 |
| 529.79 | 0.001 |
| 530.02 | 0.002 |
| 530.24 | -0.001 |
| 530.47 | 0.001 |
| 530.7 | 0 |
| 530.92 | 0 |
| 531.15 | 0.002 |
| 531.37 | -0.001 |
| 531.6 | -0.003 |
| 531.83 | -0.001 |
| 532.05 | -0.001 |
| 532.28 | -0.001 |
| 532.51 | -0.002 |
| 532.73 | 0.001 |
| 532.96 | 0 |
| 533.18 | 0 |
| 533.41 | -0.001 |
| 533.64 | -0.003 |
| 533.86 | -0.001 |
| 534.09 | 0 |
| 534.32 | 0.001 |
| 534.54 | -0.001 |
| 534.77 | -0.003 |
| 535.0 | -0.001 |
| 535.22 | -0.001 |
| 535.45 | 0 |
| 535.67 | -0.001 |
| 535.9 | 0 |
| 536.13 | 0 |
| 536.35 | 0 |
| 536.58 | -0.001 |
| 536.81 | -0.002 |
| 537.03 | 0 |
| 537.26 | 0 |
| 537.49 | -0.001 |
| 537.71 | 0 |
| 537.94 | -0.003 |
| 538.17 | 0 |
| 538.39 | 0 |
| 538.62 | -0.001 |
| 538.85 | 0 |
| 539.07 | 0 |
| 539.3 | 0 |
| 539.53 | 0.001 |
| 539.75 | -0.001 |
| 539.98 | 0 |
| 540.21 | -0.001 |
| 540.43 | 0 |
| 540.66 | -0.001 |
| 540.89 | 0.001 |
| 541.11 | 0 |
| 541.34 | 0.001 |
| 541.57 | -0.001 |
| 541.79 | 0 |
| 542.02 | 0 |
| 542.25 | 0.001 |
| 542.47 | -0.002 |
| 542.7 | -0.002 |
| 542.93 | -0.002 |
| 543.15 | 0 |
| 543.38 | -0.001 |
| 543.61 | 0.003 |
| 543.83 | -0.001 |
| 544.06 | -0.001 |
| 544.29 | -0.002 |
| 544.51 | 0.001 |
| 544.74 | -0.001 |
| 544.97 | 0 |
| 545.2 | 0 |
| 545.42 | -0.002 |
| 545.65 | -0.001 |
| 545.88 | 0.003 |
| 546.1 | -0.001 |
| 546.33 | 0.001 |
| 546.56 | 0 |
| 546.78 | 0.001 |
| 547.01 | -0.002 |
| 547.24 | 0.002 |
| 547.47 | 0.001 |
| 547.69 | 0 |
| 547.92 | 0 |
| 548.15 | 0 |
| 548.37 | -0.001 |
| 548.6 | 0 |
| 548.83 | -0.001 |
| 549.06 | -0.002 |
| 549.28 | -0.001 |
| 549.51 | 0.001 |
| 549.74 | -0.002 |
| 549.96 | -0.002 |
| 550.19 | 0 |
| 550.42 | 0 |
| 550.65 | 0 |
| 550.87 | 0.002 |
| 551.1 | -0.003 |
| 551.33 | 0 |
| 551.55 | -0.002 |
| 551.78 | -0.001 |
| 552.01 | -0.001 |
| 552.24 | 0.002 |
| 552.46 | -0.001 |
| 552.69 | 0 |
| 552.92 | -0.001 |
| 553.15 | 0.001 |
| 553.37 | -0.001 |
| 553.6 | -0.001 |
| 553.83 | -0.001 |
| 554.06 | 0 |
| 554.28 | 0 |
| 554.51 | 0.002 |
| 554.74 | -0.001 |
| 554.97 | 0.001 |
| 555.19 | 0 |
| 555.42 | 0.001 |
| 555.65 | 0.001 |
| 555.87 | 0 |
| 556.1 | 0.001 |
| 556.33 | 0 |
| 556.56 | 0.002 |
| 556.79 | 0 |
| 557.01 | -0.003 |
| 557.24 | 0.002 |
| 557.47 | -0.001 |
| 557.7 | 0.001 |
| 557.92 | 0 |
| 558.15 | 0.001 |
| 558.38 | 0 |
| 558.61 | 0 |
| 558.83 | -0.002 |
| 559.06 | 0 |
| 559.29 | 0 |
| 559.52 | 0.001 |
| 559.74 | 0.001 |
| 559.97 | -0.001 |
| 560.2 | 0 |
| 560.43 | 0.001 |
| 560.66 | 0.001 |
| 560.88 | 0.002 |
| 561.11 | -0.001 |
| 561.34 | 0.001 |
| 561.57 | -0.001 |
| 561.79 | 0 |
| 562.02 | -0.001 |
| 562.25 | 0.001 |
| 562.48 | -0.002 |
| 562.71 | -0.001 |
| 562.93 | -0.001 |
| 563.16 | 0.001 |
| 563.39 | -0.002 |
| 563.62 | -0.001 |
| 563.84 | 0 |
| 564.07 | 0 |
| 564.3 | -0.002 |
| 564.53 | 0 |
| 564.76 | -0.001 |
| 564.98 | 0 |
| 565.21 | -0.001 |
| 565.44 | 0 |
| 565.67 | 0 |
| 565.9 | 0 |
| 566.12 | 0.001 |
| 566.35 | -0.002 |
| 566.58 | 0 |
| 566.81 | 0.001 |
| 567.04 | -0.004 |
| 567.26 | -0.001 |
| 567.49 | -0.001 |
| 567.72 | 0.001 |
| 567.95 | -0.001 |
| 568.18 | 0.001 |
| 568.41 | 0 |
| 568.63 | 0.001 |
| 568.86 | 0.001 |
| 569.09 | 0 |
| 569.32 | -0.002 |
| 569.55 | 0.001 |
| 569.77 | 0 |
| 570.0 | 0.002 |
| 570.23 | -0.002 |
| 570.46 | 0 |
| 570.69 | 0 |
| 570.92 | 0.002 |
| 571.14 | -0.002 |
| 571.37 | 0 |
| 571.6 | -0.001 |
| 571.83 | -0.002 |
| 572.06 | -0.001 |
| 572.29 | 0 |
| 572.51 | -0.001 |
| 572.74 | 0 |
| 572.97 | -0.002 |
| 573.2 | 0 |
| 573.43 | 0.001 |
| 573.66 | 0.001 |
| 573.88 | -0.001 |
| 574.11 | 0.002 |
| 574.34 | -0.001 |
| 574.57 | 0 |
| 574.8 | 0.001 |
| 575.03 | -0.001 |
| 575.26 | 0.001 |
| 575.48 | 0.001 |
| 575.71 | 0 |
| 575.94 | -0.002 |
| 576.17 | -0.001 |
| 576.4 | -0.001 |
| 576.63 | -0.002 |
| 576.85 | -0.001 |
| 577.08 | -0.001 |
| 577.31 | 0 |
| 577.54 | -0.001 |
| 577.77 | 0 |
| 578.0 | 0.002 |
| 578.23 | -0.001 |
| 578.46 | 0.001 |
| 578.68 | -0.002 |
| 578.91 | 0.001 |
| 579.14 | -0.002 |
| 579.37 | 0.001 |
| 579.6 | -0.001 |
| 579.83 | -0.001 |
| 580.06 | 0 |
| 580.28 | 0 |
| 580.51 | 0 |
| 580.74 | 0.001 |
| 580.97 | -0.001 |
| 581.2 | 0 |
| 581.43 | -0.002 |
| 581.66 | 0 |
| 581.89 | 0 |
| 582.12 | 0.001 |
| 582.34 | -0.002 |
| 582.57 | 0.001 |
| 582.8 | -0.001 |
| 583.03 | 0.001 |
| 583.26 | -0.001 |
| 583.49 | 0 |
| 583.72 | -0.001 |
| 583.95 | -0.001 |
| 584.18 | -0.001 |
| 584.4 | 0.002 |
| 584.63 | -0.002 |
| 584.86 | 0.002 |
| 585.09 | 0 |
| 585.32 | 0.001 |
| 585.55 | -0.001 |
| 585.78 | 0.001 |
| 586.01 | 0 |
| 586.24 | 0 |
| 586.47 | -0.002 |
| 586.69 | 0 |
| 586.92 | -0.001 |
| 587.15 | 0 |
| 587.38 | 0 |
| 587.61 | 0 |
| 587.84 | 0 |
| 588.07 | -0.001 |
| 588.3 | -0.002 |
| 588.53 | -0.001 |
| 588.76 | -0.001 |
| 588.99 | -0.002 |
| 589.21 | -0.002 |
| 589.44 | 0.001 |
| 589.67 | -0.001 |
| 589.9 | 0.002 |
| 590.13 | 0 |
| 590.36 | 0.001 |
| 590.59 | 0 |
| 590.82 | 0.001 |
| 591.05 | -0.002 |
| 591.28 | 0 |
| 591.51 | -0.002 |
| 591.74 | -0.001 |
| 591.97 | 0 |
| 592.19 | 0.001 |
| 592.42 | -0.001 |
| 592.65 | 0 |
| 592.88 | 0 |
| 593.11 | 0 |
| 593.34 | 0.001 |
| 593.57 | 0 |
| 593.8 | -0.001 |
| 594.03 | 0.001 |
| 594.26 | 0.001 |
| 594.49 | 0 |
| 594.72 | -0.001 |
| 594.95 | -0.002 |
| 595.18 | -0.001 |
| 595.41 | 0 |
| 595.64 | -0.001 |
| 595.87 | 0.001 |
| 596.1 | 0.001 |
| 596.32 | -0.002 |
| 596.55 | 0.001 |
| 596.78 | 0 |
| 597.01 | -0.002 |
| 597.24 | 0.001 |
| 597.47 | 0 |
| 597.7 | 0.001 |
| 597.93 | 0 |
| 598.16 | 0.002 |
| 598.39 | -0.001 |
| 598.62 | 0.001 |
| 598.85 | 0.001 |
| 599.08 | 0.002 |
| 599.31 | -0.002 |
| 599.54 | 0 |
| 599.77 | -0.001 |
| 600.0 | 0 |
| 600.23 | -0.001 |
| 600.46 | 0.002 |
| 600.69 | 0 |
| 600.92 | 0.003 |
| 601.15 | 0 |
| 601.38 | 0.001 |
| 601.61 | -0.001 |
| 601.84 | 0.002 |
| 602.07 | 0.002 |
| 602.3 | -0.001 |
| 602.53 | 0.001 |
| 602.76 | 0.001 |
| 602.99 | 0.001 |
| 603.22 | -0.002 |
| 603.45 | 0 |
| 603.68 | 0.001 |
| 603.91 | -0.001 |
| 604.14 | 0.002 |
| 604.36 | -0.001 |
| 604.59 | 0.001 |
| 604.82 | -0.001 |
| 605.05 | 0.001 |
| 605.28 | 0 |
| 605.51 | 0.001 |
| 605.74 | -0.002 |
| 605.97 | 0.002 |
| 606.2 | -0.001 |
| 606.43 | 0 |
| 606.66 | -0.003 |
| 606.89 | 0 |
| 607.12 | -0.001 |
| 607.35 | 0.003 |
| 607.58 | 0 |
| 607.81 | -0.001 |
| 608.05 | -0.002 |
| 608.28 | -0.002 |
| 608.51 | 0.001 |
| 608.74 | 0.001 |
| 608.97 | 0 |
| 609.2 | 0 |
| 609.43 | -0.002 |
| 609.66 | 0 |
| 609.89 | -0.001 |
| 610.12 | 0.001 |
| 610.35 | -0.001 |
| 610.58 | -0.001 |
| 610.81 | -0.001 |
| 611.04 | 0.001 |
| 611.27 | -0.001 |
| 611.5 | -0.001 |
| 611.73 | -0.001 |
| 611.96 | 0.001 |
| 612.19 | -0.001 |
| 612.42 | -0.001 |
| 612.65 | 0 |
| 612.88 | 0.003 |
| 613.11 | -0.001 |
| 613.34 | 0.001 |
| 613.57 | 0.001 |
| 613.8 | -0.001 |
| 614.03 | -0.001 |
| 614.26 | -0.001 |
| 614.49 | -0.001 |
| 614.72 | 0.002 |
| 614.95 | -0.001 |
| 615.18 | -0.001 |
| 615.41 | -0.002 |
| 615.64 | -0.001 |
| 615.87 | 0.001 |
| 616.1 | -0.003 |
| 616.34 | 0.001 |
| 616.57 | -0.001 |
| 616.8 | 0.001 |
| 617.03 | 0.001 |
| 617.26 | -0.001 |
| 617.49 | 0.001 |
| 617.72 | 0 |
| 617.95 | 0.001 |
| 618.18 | -0.001 |
| 618.41 | -0.001 |
| 618.64 | -0.002 |
| 618.87 | 0 |
| 619.1 | -0.003 |
| 619.33 | -0.001 |
| 619.56 | -0.001 |
| 619.79 | 0.001 |
| 620.02 | 0 |
| 620.26 | 0.002 |
| 620.49 | -0.001 |
| 620.72 | 0.001 |
| 620.95 | -0.001 |
| 621.18 | -0.001 |
| 621.41 | 0.002 |
| 621.64 | -0.001 |
| 621.87 | -0.001 |
| 622.1 | 0.001 |
| 622.33 | -0.003 |
| 622.56 | 0.001 |
| 622.79 | 0 |
| 623.02 | -0.001 |
| 623.25 | 0 |
| 623.49 | 0 |
| 623.72 | 0 |
| 623.95 | 0 |
| 624.18 | -0.001 |
| 624.41 | 0 |
| 624.64 | 0.001 |
| 624.87 | 0.001 |
| 625.1 | -0.001 |
| 625.33 | 0.001 |
| 625.56 | 0.001 |
| 625.79 | 0 |
| 626.03 | 0 |
| 626.26 | -0.001 |
| 626.49 | -0.001 |
| 626.72 | -0.001 |
| 626.95 | 0.001 |
| 627.18 | 0 |
| 627.41 | -0.002 |
| 627.64 | 0.002 |
| 627.87 | 0.001 |
| 628.1 | 0.001 |
| 628.33 | -0.001 |
| 628.57 | 0 |
| 628.8 | -0.002 |
| 629.03 | -0.002 |
| 629.26 | -0.001 |
| 629.49 | 0 |
| 629.72 | -0.001 |
| 629.95 | -0.001 |
| 630.18 | 0 |
| 630.41 | 0 |
| 630.65 | -0.001 |
| 630.88 | -0.001 |
| 631.11 | -0.001 |
| 631.34 | -0.001 |
| 631.57 | -0.001 |
| 631.8 | 0.003 |
| 632.03 | 0 |
| 632.26 | 0 |
| 632.5 | -0.001 |
| 632.73 | 0 |
| 632.96 | 0 |
| 633.19 | 0 |
| 633.42 | -0.003 |
| 633.65 | -0.001 |
| 633.88 | 0.002 |
| 634.11 | -0.001 |
| 634.35 | 0 |
| 634.58 | -0.001 |
| 634.81 | 0.002 |
| 635.04 | -0.001 |
| 635.27 | 0.001 |
| 635.5 | -0.001 |
| 635.73 | -0.001 |
| 635.96 | -0.003 |
| 636.2 | 0.001 |
| 636.43 | -0.001 |
| 636.66 | 0.002 |
| 636.89 | 0 |
| 637.12 | 0 |
| 637.35 | -0.001 |
| 637.58 | -0.001 |
| 637.82 | -0.001 |
| 638.05 | 0.002 |
| 638.28 | 0 |
| 638.51 | 0.001 |
| 638.74 | -0.001 |
| 638.97 | 0 |
| 639.21 | -0.002 |
| 639.44 | -0.001 |
| 639.67 | -0.001 |
| 639.9 | 0.001 |
| 640.13 | -0.002 |
| 640.36 | -0.001 |
| 640.59 | 0 |
| 640.83 | 0 |
| 641.06 | 0 |
| 641.29 | 0 |
| 641.52 | 0 |
| 641.75 | 0 |
| 641.98 | -0.001 |
| 642.22 | -0.001 |
| 642.45 | -0.001 |
| 642.68 | 0 |
| 642.91 | 0.001 |
| 643.14 | -0.001 |
| 643.37 | 0 |
| 643.61 | -0.001 |
| 643.84 | -0.001 |
| 644.07 | -0.001 |
| 644.3 | -0.001 |
| 644.53 | 0.001 |
| 644.76 | 0 |
| 645.0 | 0 |
| 645.23 | -0.002 |
| 645.46 | 0 |
| 645.69 | -0.001 |
| 645.92 | 0.001 |
| 646.16 | -0.001 |
| 646.39 | -0.001 |
| 646.62 | 0.001 |
| 646.85 | -0.002 |
| 647.08 | -0.001 |
| 647.31 | -0.001 |
| 647.55 | -0.002 |
| 647.78 | 0.001 |
| 648.01 | -0.002 |
| 648.24 | 0 |
| 648.47 | -0.002 |
| 648.71 | 0 |
| 648.94 | -0.002 |
| 649.17 | 0 |
| 649.4 | 0 |
| 649.63 | -0.001 |
| 649.87 | 0 |
| 650.1 | 0 |
| 650.33 | -0.001 |
| 650.56 | 0.001 |
| 650.79 | 0.001 |
| 651.03 | 0.004 |
| 651.26 | 0 |
| 651.49 | 0.002 |
| 651.72 | 0.001 |
| 651.95 | -0.001 |
| 652.19 | -0.002 |
| 652.42 | -0.001 |
| 652.65 | -0.002 |
| 652.88 | -0.001 |
| 653.12 | -0.001 |
| 653.35 | 0 |
| 653.58 | 0.002 |
| 653.81 | 0.001 |
| 654.04 | -0.001 |
| 654.28 | -0.002 |
| 654.51 | -0.001 |
| 654.74 | 0.001 |
| 654.97 | 0.002 |
| 655.2 | -0.001 |
| 655.44 | -0.002 |
| 655.67 | 0 |
| 655.9 | -0.001 |
| 656.13 | 0.001 |
| 656.37 | -0.001 |
| 656.6 | 0 |
| 656.83 | -0.001 |
| 657.06 | 0.002 |
| 657.3 | -0.001 |
| 657.53 | 0 |
| 657.76 | -0.002 |
| 657.99 | 0 |
| 658.22 | -0.003 |
| 658.46 | 0.002 |
| 658.69 | -0.003 |
| 658.92 | 0 |
| 659.15 | 0 |
| 659.39 | -0.003 |
| 659.62 | -0.001 |
| 659.85 | -0.002 |
| 660.08 | 0 |
| 660.32 | -0.001 |
| 660.55 | -0.002 |
| 660.78 | 0.001 |
| 661.01 | 0 |
| 661.25 | -0.001 |
| 661.48 | -0.001 |
| 661.71 | -0.001 |
| 661.94 | 0 |
| 662.18 | 0.002 |
| 662.41 | -0.002 |
| 662.64 | 0.001 |
| 662.87 | 0.002 |
| 663.11 | -0.001 |
| 663.34 | 0 |
| 663.57 | -0.002 |
| 663.8 | -0.001 |
| 664.04 | 0 |
| 664.27 | -0.001 |
| 664.5 | 0.002 |
| 664.73 | 0.001 |
| 664.97 | 0 |
| 665.2 | -0.004 |
| 665.43 | -0.002 |
| 665.67 | -0.002 |
| 665.9 | 0.001 |
| 666.13 | -0.002 |
| 666.36 | -0.001 |
| 666.6 | -0.003 |
| 666.83 | 0 |
| 667.06 | 0.001 |
| 667.29 | 0.001 |
| 667.53 | 0 |
| 667.76 | 0.002 |
| 667.99 | -0.001 |
| 668.23 | 0.003 |
| 668.46 | 0 |
| 668.69 | 0 |
| 668.92 | -0.001 |
| 669.16 | -0.001 |
| 669.39 | -0.002 |
| 669.62 | 0.002 |
| 669.86 | -0.002 |
| 670.09 | -0.001 |
| 670.32 | -0.002 |
| 670.55 | 0 |
| 670.79 | -0.001 |
| 671.02 | 0.002 |
| 671.25 | -0.002 |
| 671.49 | 0 |
| 671.72 | -0.002 |
| 671.95 | 0 |
| 672.18 | 0.001 |
| 672.42 | 0.002 |
| 672.65 | 0.001 |
| 672.88 | 0.001 |
| 673.12 | -0.001 |
| 673.35 | 0.001 |
| 673.58 | 0.001 |
| 673.82 | -0.001 |
| 674.05 | -0.001 |
| 674.28 | 0.001 |
| 674.51 | 0.001 |
| 674.75 | 0 |
| 674.98 | 0 |
| 675.21 | 0.001 |
| 675.45 | -0.001 |
| 675.68 | -0.001 |
| 675.91 | 0 |
| 676.15 | 0 |
| 676.38 | -0.001 |
| 676.61 | 0.001 |
| 676.85 | -0.001 |
| 677.08 | 0.001 |
| 677.31 | 0 |
| 677.54 | 0 |
| 677.78 | -0.003 |
| 678.01 | 0.001 |
| 678.24 | -0.004 |
| 678.48 | -0.001 |
| 678.71 | 0.001 |
| 678.94 | 0.002 |
| 679.18 | 0.002 |
| 679.41 | 0.001 |
| 679.64 | -0.001 |
| 679.88 | 0.001 |
| 680.11 | -0.002 |
| 680.34 | -0.001 |
| 680.58 | 0 |
| 680.81 | -0.001 |
| 681.04 | 0 |
| 681.28 | -0.001 |
| 681.51 | -0.001 |
| 681.74 | 0 |
| 681.98 | -0.001 |
| 682.21 | 0 |
| 682.44 | 0 |
| 682.68 | 0.002 |
| 682.91 | -0.001 |
| 683.14 | 0 |
| 683.38 | 0.001 |
| 683.61 | 0.001 |
| 683.84 | -0.001 |
| 684.08 | 0 |
| 684.31 | 0 |
| 684.54 | 0 |
| 684.78 | 0 |
| 685.01 | 0.001 |
| 685.25 | 0.001 |
| 685.48 | -0.001 |
| 685.71 | 0 |
| 685.95 | 0.001 |
| 686.18 | -0.002 |
| 686.41 | 0.001 |
| 686.65 | -0.002 |
| 686.88 | 0.001 |
| 687.11 | -0.001 |
| 687.35 | -0.002 |
| 687.58 | -0.001 |
| 687.81 | 0.003 |
| 688.05 | -0.001 |
| 688.28 | 0 |
| 688.52 | -0.002 |
| 688.75 | 0.002 |
| 688.98 | 0 |
| 689.22 | 0.001 |
| 689.45 | -0.001 |
| 689.68 | 0.001 |
| 689.92 | -0.001 |
| 690.15 | 0 |
| 690.38 | 0 |
| 690.62 | 0.001 |
| 690.85 | 0.001 |
| 691.09 | 0 |
| 691.32 | 0 |
| 691.55 | 0 |
| 691.79 | -0.001 |
| 692.02 | 0.001 |
| 692.25 | -0.001 |
| 692.49 | 0.001 |
| 692.72 | -0.001 |
| 692.96 | 0.001 |
| 693.19 | 0 |
| 693.42 | -0.002 |
| 693.66 | 0 |
| 693.89 | -0.002 |
| 694.12 | 0.001 |
| 694.36 | 0 |
| 694.59 | 0.002 |
| 694.83 | 0 |
| 695.06 | 0.001 |
| 695.29 | -0.002 |
| 695.53 | 0.001 |
| 695.76 | -0.001 |
| 696.0 | 0.001 |
| 696.23 | 0 |
| 696.46 | 0.001 |
| 696.7 | -0.001 |
| 696.93 | 0 |
| 697.17 | -0.002 |
| 697.4 | -0.002 |
| 697.63 | 0.001 |
| 697.87 | 0 |
| 698.1 | -0.002 |
| 698.34 | 0 |
| 698.57 | -0.001 |
| 698.8 | 0 |
| 699.04 | 0 |
| 699.27 | 0 |
| 699.51 | 0.001 |
| 699.74 | 0.002 |
| 699.97 | 0.001 |
| 700.21 | 0.003 |
| 700.44 | 0 |
| 700.68 | 0 |
| 700.91 | -0.001 |
| 701.14 | 0.002 |
| 701.38 | -0.001 |
| 701.61 | 0 |
| 701.85 | -0.001 |
| 702.08 | 0 |
| 702.32 | 0 |
| 702.55 | 0 |
| 702.78 | -0.001 |
| 703.02 | -0.001 |
| 703.25 | -0.001 |
| 703.49 | 0.001 |
| 703.72 | 0 |
| 703.96 | -0.001 |
| 704.19 | -0.001 |
| 704.42 | 0.001 |
| 704.66 | 0.002 |
| 704.89 | 0.001 |
| 705.13 | -0.001 |
| 705.36 | 0 |
| 705.6 | -0.001 |
| 705.83 | 0 |
| 706.06 | 0 |
| 706.3 | 0.003 |
| 706.53 | -0.001 |
| 706.77 | -0.001 |
| 707.0 | 0.001 |
| 707.24 | 0 |
| 707.47 | -0.002 |
| 707.7 | 0.001 |
| 707.94 | -0.001 |
| 708.17 | 0 |
| 708.41 | -0.001 |
| 708.64 | 0 |
| 708.88 | 0 |
| 709.11 | -0.001 |
| 709.35 | -0.001 |
| 709.58 | 0.002 |
| 709.81 | -0.002 |
| 710.05 | 0.001 |
| 710.28 | -0.001 |
| 710.52 | 0 |
| 710.75 | 0 |
| 710.99 | 0 |
| 711.22 | -0.002 |
| 711.46 | 0.002 |
| 711.69 | -0.002 |
| 711.92 | 0 |
| 712.16 | -0.001 |
| 712.39 | 0.001 |
| 712.63 | -0.003 |
| 712.86 | -0.003 |
| 713.1 | 0.002 |
| 713.33 | -0.002 |
| 713.57 | 0 |
| 713.8 | 0.002 |
| 714.04 | -0.003 |
| 714.27 | -0.001 |
| 714.51 | -0.002 |
| 714.74 | -0.001 |
| 714.97 | -0.001 |
| 715.21 | 0 |
| 715.44 | -0.001 |
| 715.68 | 0.001 |
| 715.91 | -0.001 |
| 716.15 | 0.001 |
| 716.38 | -0.001 |
| 716.62 | 0.002 |
| 716.85 | -0.002 |
| 717.09 | 0.002 |
| 717.32 | 0.001 |
| 717.56 | -0.003 |
| 717.79 | 0 |
| 718.03 | 0.001 |
| 718.26 | -0.002 |
| 718.5 | 0.001 |
| 718.73 | -0.002 |
| 718.97 | 0 |
| 719.2 | 0 |
| 719.44 | 0 |
| 719.67 | 0.001 |
| 719.91 | -0.002 |
| 720.14 | -0.001 |
| 720.37 | -0.001 |
| 720.61 | 0.002 |
| 720.84 | 0 |
| 721.08 | -0.001 |
| 721.31 | 0.002 |
| 721.55 | -0.002 |
| 721.78 | 0 |
| 722.02 | 0 |
| 722.25 | 0 |
| 722.49 | -0.002 |
| 722.72 | 0.002 |
| 722.96 | 0 |
| 723.19 | 0 |
| 723.43 | -0.002 |
| 723.66 | 0 |
| 723.9 | 0.001 |
| 724.13 | 0.001 |
| 724.37 | -0.002 |
| 724.6 | 0 |
| 724.84 | -0.002 |
| 725.07 | 0 |
| 725.31 | -0.002 |
| 725.54 | 0.002 |
| 725.78 | -0.001 |
| 726.01 | 0 |
| 726.25 | 0.001 |
| 726.48 | 0.003 |
| 726.72 | -0.002 |
| 726.96 | 0.003 |
| 727.19 | 0 |
| 727.43 | 0 |
| 727.66 | 0 |
| 727.9 | 0.001 |
| 728.13 | 0.002 |
| 728.37 | 0.001 |
| 728.6 | 0 |
| 728.84 | 0 |
| 729.07 | -0.001 |
| 729.31 | 0.001 |
| 729.54 | -0.004 |
| 729.78 | 0.002 |
| 730.01 | -0.001 |
| 730.25 | 0.001 |
| 730.48 | -0.001 |
| 730.72 | 0.002 |
| 730.95 | -0.002 |
| 731.19 | 0.001 |
| 731.42 | 0 |
| 731.66 | 0 |
| 731.89 | 0.003 |
| 732.13 | 0.002 |
| 732.37 | -0.001 |
| 732.6 | 0 |
| 732.84 | -0.004 |
| 733.07 | 0 |
| 733.31 | 0 |
| 733.54 | -0.001 |
| 733.78 | -0.001 |
| 734.01 | 0 |
| 734.25 | -0.001 |
| 734.48 | -0.002 |
| 734.72 | 0.001 |
| 734.95 | -0.003 |
| 735.19 | -0.002 |
| 735.43 | 0 |
| 735.66 | -0.001 |
| 735.9 | 0.001 |
| 736.13 | -0.002 |
| 736.37 | 0 |
| 736.6 | -0.001 |
| 736.84 | 0.001 |
| 737.07 | 0 |
| 737.31 | 0.002 |
| 737.55 | 0.001 |
| 737.78 | -0.001 |
| 738.02 | 0.002 |
| 738.25 | 0 |
| 738.49 | -0.001 |
| 738.72 | 0.001 |
| 738.96 | -0.002 |
| 739.19 | 0.001 |
| 739.43 | -0.001 |
| 739.67 | -0.001 |
| 739.9 | -0.002 |
| 740.14 | 0 |
| 740.37 | -0.001 |
| 740.61 | 0.001 |
| 740.84 | -0.001 |
| 741.08 | 0.001 |
| 741.31 | -0.002 |
| 741.55 | 0.001 |
| 741.79 | -0.001 |
| 742.02 | 0.002 |
| 742.26 | -0.002 |
| 742.49 | 0 |
| 742.73 | -0.002 |
| 742.96 | 0 |
| 743.2 | 0 |
| 743.44 | 0.002 |
| 743.67 | -0.002 |
| 743.91 | 0.002 |
| 744.14 | -0.001 |
| 744.38 | -0.001 |
| 744.61 | 0 |
| 744.85 | 0.002 |
| 745.09 | -0.003 |
| 745.32 | 0.001 |
| 745.56 | 0.001 |
| 745.79 | -0.002 |
| 746.03 | 0.001 |
| 746.27 | 0.001 |
| 746.5 | 0.001 |
| 746.74 | 0 |
| 746.97 | -0.001 |
| 747.21 | 0 |
| 747.44 | 0 |
| 747.68 | -0.002 |
| 747.92 | -0.001 |
| 748.15 | 0.001 |
| 748.39 | -0.001 |
| 748.62 | 0.002 |
| 748.86 | 0 |
| 749.1 | 0.003 |
| 749.33 | 0 |
| 749.57 | 0 |
| 749.8 | 0 |
| 750.04 | -0.001 |
| 750.28 | -0.001 |
| 750.51 | 0.001 |
| 750.75 | -0.002 |
| 750.98 | 0.001 |
| 751.22 | 0 |
| 751.46 | 0 |
| 751.69 | -0.001 |
| 751.93 | 0.001 |
| 752.16 | -0.002 |
| 752.4 | 0 |
| 752.64 | -0.002 |
| 752.87 | 0.001 |
| 753.11 | -0.001 |
| 753.34 | -0.001 |
| 753.58 | -0.002 |
| 753.82 | -0.001 |
| 754.05 | 0 |
| 754.29 | -0.001 |
| 754.53 | 0.001 |
| 754.76 | -0.001 |
| 755.0 | 0.003 |
| 755.23 | -0.001 |
| 755.47 | 0 |
| 755.71 | -0.002 |
| 755.94 | 0 |
| 756.18 | -0.001 |
| 756.41 | -0.002 |
| 756.65 | -0.001 |
| 756.89 | 0 |
| 757.12 | 0 |
| 757.36 | -0.001 |
| 757.6 | 0 |
| 757.83 | 0.002 |
| 758.07 | 0 |
| 758.3 | 0.002 |
| 758.54 | -0.001 |
| 758.78 | 0.001 |
| 759.01 | -0.001 |
| 759.25 | -0.002 |
| 759.49 | 0 |
| 759.72 | 0.001 |
| 759.96 | -0.002 |
| 760.2 | 0.001 |
| 760.43 | 0 |
| 760.67 | 0.002 |
| 760.9 | 0.001 |
| 761.14 | 0.001 |
| 761.38 | 0 |
| 761.61 | 0.001 |
| 761.85 | -0.003 |
| 762.09 | 0.001 |
| 762.32 | -0.002 |
| 762.56 | -0.001 |
| 762.8 | -0.002 |
| 763.03 | -0.001 |
| 763.27 | 0.001 |
| 763.5 | 0.001 |
| 763.74 | -0.001 |
| 763.98 | -0.002 |
| 764.21 | -0.002 |
| 764.45 | 0.002 |
| 764.69 | -0.001 |
| 764.92 | 0 |
| 765.16 | -0.001 |
| 765.4 | -0.001 |
| 765.63 | -0.003 |
| 765.87 | 0 |
| 766.11 | 0 |
| 766.34 | 0.002 |
| 766.58 | 0 |
| 766.82 | 0 |
| 767.05 | 0 |
| 767.29 | 0.001 |
| 767.53 | 0 |
| 767.76 | 0 |
| 768.0 | -0.002 |
| 768.24 | -0.001 |
| 768.47 | -0.001 |
| 768.71 | 0 |
| 768.95 | -0.001 |
| 769.18 | 0.001 |
| 769.42 | -0.001 |
| 769.66 | 0.002 |
| 769.89 | 0.001 |
| 770.13 | 0.001 |
| 770.37 | -0.002 |
| 770.6 | 0.001 |
| 770.84 | -0.001 |
| 771.08 | -0.001 |
| 771.31 | 0 |
| 771.55 | 0.001 |
| 771.79 | -0.002 |
| 772.02 | 0.001 |
| 772.26 | 0 |
| 772.5 | 0 |
| 772.73 | -0.001 |
| 772.97 | 0 |
| 773.21 | -0.001 |
| 773.44 | 0 |
| 773.68 | 0 |
| 773.92 | 0 |
| 774.15 | 0 |
| 774.39 | -0.001 |
| 774.63 | 0.001 |
| 774.86 | 0 |
| 775.1 | -0.002 |
| 775.34 | 0 |
| 775.57 | 0.001 |
| 775.81 | 0.001 |
| 776.05 | 0.001 |
| 776.29 | 0.003 |
| 776.52 | 0 |
| 776.76 | 0 |
| 777.0 | -0.001 |
| 777.23 | 0 |
| 777.47 | -0.002 |
| 777.71 | 0 |
| 777.94 | -0.002 |
| 778.18 | -0.002 |
| 778.42 | 0.001 |
| 778.65 | -0.001 |
| 778.89 | -0.001 |
| 779.13 | 0 |
| 779.37 | -0.001 |
| 779.6 | 0.001 |
| 779.84 | -0.003 |
| 780.08 | 0 |
| 780.31 | 0 |
| 780.55 | -0.001 |
| 780.79 | 0.001 |
| 781.02 | -0.002 |
| 781.26 | 0 |
| 781.5 | -0.001 |
| 781.74 | -0.002 |
| 781.97 | -0.002 |
| 782.21 | 0 |
| 782.45 | 0 |
| 782.68 | 0 |
| 782.92 | 0.001 |
| 783.16 | 0.002 |
| 783.4 | -0.001 |
| 783.63 | 0 |
| 783.87 | 0 |
| 784.11 | 0 |
| 784.34 | 0 |
| 784.58 | 0 |
| 784.82 | 0.001 |
| 785.06 | -0.001 |
| 785.29 | 0.001 |
| 785.53 | -0.001 |
| 785.77 | 0 |
| 786.0 | 0 |
| 786.24 | -0.003 |
| 786.48 | -0.001 |
| 786.72 | 0.002 |
| 786.95 | 0 |
| 787.19 | -0.002 |
| 787.43 | 0 |
| 787.67 | -0.002 |
| 787.9 | -0.001 |
| 788.14 | -0.001 |
| 788.38 | -0.001 |
| 788.61 | -0.001 |
| 788.85 | -0.001 |
| 789.09 | 0.002 |
| 789.33 | -0.001 |
| 789.56 | 0 |
| 789.8 | -0.002 |
| 790.04 | 0 |
| 790.28 | -0.001 |
| 790.51 | 0.001 |
| 790.75 | -0.001 |
| 790.99 | -0.002 |
| 791.23 | -0.001 |
| 791.46 | -0.001 |
| 791.7 | -0.001 |
| 791.94 | 0.001 |
| 792.17 | 0 |
| 792.41 | 0.002 |
| 792.65 | 0.003 |
| 792.89 | 0 |
| 793.12 | 0.001 |
| 793.36 | 0 |
| 793.6 | -0.001 |
| 793.84 | -0.001 |
| 794.07 | -0.001 |
| 794.31 | 0.001 |
| 794.55 | 0.001 |
| 794.79 | -0.001 |
| 795.02 | 0.002 |
| 795.26 | -0.002 |
| 795.5 | -0.001 |
| 795.74 | 0.001 |
| 795.97 | -0.002 |
| 796.21 | 0 |
| 796.45 | -0.001 |
| 796.69 | 0 |
| 796.92 | -0.002 |
| 797.16 | 0.001 |
| 797.4 | -0.001 |
| 797.64 | 0 |
| 797.88 | -0.001 |
| 798.11 | -0.001 |
| 798.35 | -0.001 |
| 798.59 | -0.001 |
| 798.83 | -0.001 |
| 799.06 | 0.001 |
| 799.3 | -0.004 |
| 799.54 | -0.002 |
| 799.78 | -0.002 |
| 800.01 | 0 |
| 800.25 | 0 |
| 800.49 | 0.002 |
| 800.73 | 0.001 |
| 800.96 | 0 |
| 801.2 | 0.001 |
| 801.44 | 0.001 |
| 801.68 | -0.002 |
| 801.92 | 0 |
| 802.15 | 0 |
| 802.39 | 0.002 |
| 802.63 | -0.002 |
| 802.87 | 0.001 |
| 803.1 | 0 |
| 803.34 | -0.001 |
| 803.58 | 0 |
| 803.82 | 0 |
| 804.06 | -0.001 |
| 804.29 | -0.001 |
| 804.53 | 0.001 |
| 804.77 | -0.001 |
| 805.01 | 0 |
| 805.24 | 0.001 |
| 805.48 | -0.001 |
| 805.72 | -0.001 |
| 805.96 | 0 |
| 806.2 | 0.001 |
| 806.43 | -0.002 |
| 806.67 | 0.001 |
| 806.91 | -0.001 |
| 807.15 | 0.001 |
| 807.39 | -0.002 |
| 807.62 | 0.001 |
| 807.86 | -0.001 |
| 808.1 | 0 |
| 808.34 | -0.001 |
| 808.58 | 0.003 |
| 808.81 | 0.001 |
| 809.05 | 0.001 |
| 809.29 | -0.002 |
| 809.53 | -0.001 |
| 809.76 | -0.001 |
| 810.0 | 0.001 |
| 810.24 | 0 |
| 810.48 | 0.001 |
| 810.72 | -0.003 |
| 810.95 | -0.001 |
| 811.19 | -0.002 |
| 811.43 | 0.001 |
| 811.67 | 0.001 |
| 811.91 | 0.002 |
| 812.15 | -0.001 |
| 812.38 | 0.001 |
| 812.62 | 0.001 |
| 812.86 | -0.002 |
| 813.1 | 0.001 |
| 813.34 | -0.001 |
| 813.57 | -0.002 |
| 813.81 | 0 |
| 814.05 | 0 |
| 814.29 | 0 |
| 814.53 | 0.003 |
| 814.76 | -0.003 |
| 815.0 | 0 |
| 815.24 | 0.001 |
| 815.48 | 0 |
| 815.72 | -0.001 |
| 815.95 | 0.001 |
| 816.19 | -0.001 |
| 816.43 | 0.001 |
| 816.67 | 0 |
| 816.91 | -0.001 |
| 817.15 | -0.002 |
| 817.38 | 0.001 |
| 817.62 | 0 |
| 817.86 | 0 |
| 818.1 | -0.002 |
| 818.34 | 0.002 |
| 818.58 | -0.001 |
| 818.81 | 0.001 |
| 819.05 | -0.003 |
| 819.29 | 0.001 |
| 819.53 | -0.002 |
| 819.77 | 0 |
| 820.0 | -0.003 |
| 820.24 | -0.001 |
| 820.48 | 0 |
| 820.72 | -0.001 |
| 820.96 | 0 |
| 821.2 | 0 |
| 821.43 | -0.003 |
| 821.67 | 0 |
| 821.91 | -0.002 |
| 822.15 | 0.001 |
| 822.39 | -0.002 |
| 822.63 | 0.001 |
| 822.86 | 0 |
| 823.1 | 0 |
| 823.34 | -0.002 |
| 823.58 | -0.001 |
| 823.82 | 0.001 |
| 824.06 | 0.002 |
| 824.3 | -0.001 |
| 824.53 | 0.001 |
| 824.77 | -0.001 |
| 825.01 | 0 |
| 825.25 | -0.001 |
| 825.49 | 0 |
| 825.73 | 0 |
| 825.96 | 0 |
| 826.2 | -0.001 |
| 826.44 | -0.001 |
| 826.68 | -0.001 |
| 826.92 | 0 |
| 827.16 | 0 |
| 827.4 | 0.002 |
| 827.63 | 0.002 |
| 827.87 | -0.001 |
| 828.11 | -0.002 |
| 828.35 | 0.001 |
| 828.59 | -0.002 |
| 828.83 | 0.002 |
| 829.07 | -0.001 |
| 829.3 | -0.002 |
| 829.54 | 0 |
| 829.78 | 0.001 |
| 830.02 | -0.003 |
| 830.26 | 0 |
| 830.5 | -0.001 |
| 830.74 | -0.001 |
| 830.97 | 0.001 |
| 831.21 | 0 |
| 831.45 | -0.001 |
| 831.69 | 0.001 |
| 831.93 | 0 |
| 832.17 | -0.002 |
| 832.41 | -0.001 |
| 832.64 | 0.001 |
| 832.88 | 0 |
| 833.12 | 0 |
| 833.36 | 0 |
| 833.6 | 0 |
| 833.84 | 0 |
| 834.08 | 0 |
| 834.32 | 0 |
| 834.55 | -0.002 |
| 834.79 | -0.001 |
| 835.03 | 0 |
| 835.27 | 0 |
| 835.51 | 0.002 |
| 835.75 | -0.001 |
| 835.99 | -0.001 |
| 836.23 | 0 |
| 836.46 | 0.001 |
| 836.7 | -0.002 |
| 836.94 | -0.001 |
| 837.18 | -0.001 |
| 837.42 | -0.001 |
| 837.66 | -0.002 |
| 837.9 | -0.002 |
| 838.14 | -0.001 |
| 838.38 | 0.001 |
| 838.61 | 0.001 |
| 838.85 | 0 |
| 839.09 | -0.002 |
| 839.33 | -0.001 |
| 839.57 | 0 |
| 839.81 | 0.001 |
| 840.05 | 0 |
| 840.29 | 0.001 |
| 840.52 | -0.002 |
| 840.76 | -0.002 |
| 841.0 | -0.001 |
| 841.24 | 0 |
| 841.48 | -0.001 |
| 841.72 | 0.001 |
| 841.96 | -0.001 |
| 842.2 | 0.001 |
| 842.44 | -0.002 |
| 842.68 | 0.001 |
| 842.91 | 0 |
| 843.15 | 0.002 |
| 843.39 | -0.001 |
| 843.63 | 0 |
| 843.87 | 0.001 |
| 844.11 | -0.001 |
| 844.35 | 0 |
| 844.59 | 0.001 |
| 844.83 | -0.001 |
| 845.07 | 0.001 |
| 845.3 | -0.002 |
| 845.54 | 0 |
| 845.78 | 0.002 |
| 846.02 | -0.001 |
| 846.26 | 0 |
| 846.5 | -0.001 |
| 846.74 | -0.003 |
| 846.98 | 0.002 |
| 847.22 | 0 |
| 847.46 | -0.001 |
| 847.7 | -0.001 |
| 847.93 | -0.001 |
| 848.17 | 0 |
| 848.41 | -0.001 |
| 848.65 | -0.002 |
| 848.89 | 0.002 |
| 849.13 | 0 |
| 849.37 | 0.001 |
| 849.61 | -0.001 |
| 849.85 | -0.002 |
| 850.09 | -0.002 |
| 850.33 | 0.003 |
| 850.57 | 0.001 |
| 850.8 | 0.001 |
| 851.04 | 0 |
| 851.28 | 0.001 |
| 851.52 | -0.002 |
| 851.76 | -0.001 |
| 852.0 | -0.002 |
| 852.24 | 0 |
| 852.48 | -0.001 |
| 852.72 | -0.002 |
| 852.96 | 0 |
| 853.2 | 0 |
| 853.44 | -0.001 |
| 853.68 | 0.001 |
| 853.91 | 0 |
| 854.15 | -0.002 |
| 854.39 | -0.002 |
| 854.63 | 0.001 |
| 854.87 | 0 |
| 855.11 | -0.001 |
| 855.35 | -0.002 |
| 855.59 | 0.001 |
| 855.83 | -0.001 |
| 856.07 | 0.001 |
| 856.31 | 0 |
| 856.55 | 0.004 |
| 856.79 | -0.001 |
| 857.03 | 0.002 |
| 857.27 | -0.001 |
| 857.5 | 0.001 |
| 857.74 | -0.001 |
| 857.98 | 0 |
| 858.22 | -0.002 |
| 858.46 | 0.001 |
| 858.7 | -0.001 |
| 858.94 | -0.002 |
| 859.18 | 0.002 |
| 859.42 | -0.001 |
| 859.66 | 0 |
| 859.9 | 0 |
| 860.14 | -0.001 |
| 860.38 | -0.001 |
| 860.62 | -0.003 |
| 860.86 | 0 |
| 861.1 | -0.001 |
| 861.34 | 0 |
| 861.58 | 0 |
| 861.81 | 0.002 |
| 862.05 | -0.001 |
| 862.29 | 0 |
| 862.53 | 0 |
| 862.77 | 0.001 |
| 863.01 | -0.001 |
| 863.25 | 0.002 |
| 863.49 | 0.002 |
| 863.73 | 0 |
| 863.97 | -0.002 |
| 864.21 | 0.002 |
| 864.45 | -0.001 |
| 864.69 | 0.001 |
| 864.93 | -0.001 |
| 865.17 | 0.001 |
| 865.41 | -0.003 |
| 865.65 | 0 |
| 865.89 | 0.001 |
| 866.13 | 0.001 |
| 866.37 | -0.001 |
| 866.61 | 0.002 |
| 866.85 | -0.001 |
| 867.09 | 0.002 |
| 867.32 | -0.002 |
| 867.56 | -0.002 |
| 867.8 | -0.001 |
| 868.04 | 0.001 |
| 868.28 | -0.002 |
| 868.52 | 0.002 |
| 868.76 | -0.001 |
| 869.0 | 0.002 |
| 869.24 | -0.002 |
| 869.48 | 0.001 |
| 869.72 | -0.001 |
| 869.96 | -0.001 |
| 870.2 | -0.001 |
| 870.44 | 0 |
| 870.68 | -0.002 |
| 870.92 | 0.001 |
| 871.16 | -0.001 |
| 871.4 | 0 |
| 871.64 | 0.002 |
| 871.88 | 0.001 |
| 872.12 | 0 |
| 872.36 | 0 |
| 872.6 | -0.002 |
| 872.84 | 0.002 |
| 873.08 | 0.001 |
| 873.32 | 0.004 |
| 873.56 | -0.002 |
| 873.8 | -0.001 |
| 874.04 | -0.001 |
| 874.28 | 0 |
| 874.52 | 0 |
| 874.76 | 0 |
| 875.0 | 0.001 |
| 875.24 | -0.001 |
| 875.48 | 0 |
| 875.72 | 0.001 |
| 875.96 | 0 |
| 876.2 | -0.001 |
| 876.44 | 0.001 |
| 876.68 | 0 |
| 876.92 | 0 |
| 877.16 | 0 |
| 877.4 | -0.002 |
| 877.64 | 0 |
| 877.88 | 0 |
| 878.12 | 0 |
| 878.36 | -0.001 |
| 878.6 | 0 |
| 878.84 | -0.002 |
| 879.08 | 0.001 |
| 879.32 | -0.001 |
| 879.56 | -0.001 |
| 879.8 | 0.002 |
| 880.04 | 0.001 |
| 880.28 | 0 |
| 880.52 | 0 |
| 880.76 | -0.001 |
| 881.0 | -0.003 |
| 881.24 | -0.001 |
| 881.48 | -0.001 |
| 881.72 | -0.001 |
| 881.96 | -0.002 |
| 882.2 | 0.001 |
| 882.44 | 0 |
| 882.68 | 0.002 |
| 882.92 | 0.002 |
| 883.16 | 0 |
| 883.4 | 0.001 |
| 883.64 | 0.001 |
| 883.88 | -0.003 |
| 884.12 | 0.001 |
| 884.36 | -0.003 |
| 884.6 | 0.001 |
| 884.84 | 0 |
| 885.08 | 0 |
| 885.32 | 0 |
| 885.56 | -0.001 |
| 885.8 | 0 |
| 886.04 | 0 |
| 886.28 | -0.003 |
| 886.52 | 0.001 |
| 886.76 | 0 |
| 887.0 | -0.001 |
| 887.24 | 0 |
| 887.48 | 0 |
| 887.72 | 0 |
| 887.96 | -0.002 |
| 888.2 | -0.001 |
| 888.44 | 0 |
| 888.68 | 0 |
| 888.92 | 0.002 |
| 889.16 | -0.002 |
| 889.4 | -0.001 |
| 889.64 | -0.002 |
| 889.88 | 0 |
| 890.12 | -0.001 |
| 890.36 | 0 |
| 890.6 | 0 |
| 890.84 | -0.001 |
| 891.08 | -0.001 |
| 891.32 | 0.002 |
| 891.56 | 0 |
| 891.8 | 0.001 |
| 892.04 | -0.001 |
| 892.28 | 0.001 |
| 892.52 | -0.002 |
| 892.76 | 0 |
| 893.0 | -0.002 |
| 893.24 | -0.001 |
| 893.48 | -0.001 |
| 893.73 | -0.001 |
| 893.97 | -0.002 |
| 894.21 | 0 |
| 894.45 | 0 |
| 894.69 | -0.001 |
| 894.93 | 0 |
| 895.17 | 0 |
| 895.41 | 0 |
| 895.65 | 0.001 |
| 895.89 | -0.001 |
| 896.13 | -0.002 |
| 896.37 | 0.001 |
| 896.61 | 0.002 |
| 896.85 | -0.001 |
| 897.09 | -0.001 |
| 897.33 | 0.001 |
| 897.57 | 0.002 |
| 897.81 | -0.001 |
| 898.05 | 0 |
| 898.29 | -0.001 |
| 898.53 | 0 |
| 898.77 | 0 |
| 899.01 | 0.001 |
| 899.25 | 0.002 |
| 899.5 | -0.001 |
| 899.74 | -0.001 |
| 899.98 | 0.001 |
| 900.22 | 0 |
| 900.46 | -0.001 |
| 900.7 | -0.002 |
| 900.94 | 0.001 |
| 901.18 | 0 |
| 901.42 | 0.002 |
| 901.66 | -0.002 |
| 901.9 | 0.002 |
| 902.14 | -0.001 |
| 902.38 | 0.001 |
| 902.62 | -0.001 |
| 902.86 | -0.001 |
| 903.1 | 0 |
| 903.34 | 0.001 |
| 903.58 | -0.001 |
| 903.82 | 0.001 |
| 904.07 | 0 |
| 904.31 | -0.002 |
| 904.55 | 0 |
| 904.79 | 0.001 |
| 905.03 | 0.001 |
| 905.27 | 0.001 |
| 905.51 | -0.001 |
| 905.75 | -0.001 |
| 905.99 | 0.001 |
| 906.23 | 0.001 |
| 906.47 | 0 |
| 906.71 | 0 |
| 906.95 | 0 |
| 907.19 | 0.001 |
| 907.43 | -0.001 |
| 907.68 | -0.001 |
| 907.92 | -0.001 |
| 908.16 | -0.001 |
| 908.4 | -0.001 |
| 908.64 | 0 |
| 908.88 | 0.001 |
| 909.12 | -0.003 |
| 909.36 | 0 |
| 909.6 | 0.002 |
| 909.84 | 0 |
| 910.08 | 0.001 |
| 910.32 | -0.003 |
| 910.56 | 0.003 |
| 910.8 | 0 |
| 911.05 | 0 |
| 911.29 | 0.001 |
| 911.53 | 0.002 |
| 911.77 | -0.001 |
| 912.01 | 0.001 |
| 912.25 | -0.001 |
| 912.49 | 0 |
| 912.73 | -0.001 |
| 912.97 | -0.001 |
| 913.21 | -0.001 |
| 913.45 | 0 |
| 913.69 | -0.001 |
| 913.93 | 0.001 |
| 914.18 | 0.001 |
| 914.42 | 0 |
| 914.66 | 0 |
| 914.9 | 0 |
| 915.14 | 0.001 |
| 915.38 | 0 |
| 915.62 | -0.002 |
| 915.86 | 0.001 |
| 916.1 | -0.002 |
| 916.34 | 0 |
| 916.58 | -0.001 |
| 916.83 | -0.001 |
| 917.07 | -0.002 |
| 917.31 | 0.001 |
| 917.55 | 0.001 |
| 917.79 | 0.002 |
| 918.03 | 0 |
| 918.27 | 0.001 |
| 918.51 | -0.002 |
| 918.75 | -0.001 |
| 918.99 | 0 |
| 919.23 | -0.001 |
| 919.48 | 0 |
| 919.72 | 0.002 |
| 919.96 | -0.001 |
| 920.2 | 0 |
| 920.44 | 0 |
| 920.68 | 0 |
| 920.92 | 0 |
| 921.16 | 0.001 |
| 921.4 | -0.001 |
| 921.64 | 0 |
| 921.89 | -0.001 |
| 922.13 | 0 |
| 922.37 | -0.001 |
| 922.61 | -0.001 |
| 922.85 | -0.003 |
| 923.09 | -0.002 |
| 923.33 | 0 |
| 923.57 | 0.002 |
| 923.81 | -0.001 |
| 924.05 | 0 |
| 924.3 | 0 |
| 924.54 | 0 |
| 924.78 | 0 |
| 925.02 | 0 |
| 925.26 | 0.001 |
| 925.5 | 0.001 |
| 925.74 | 0.001 |
| 925.98 | 0.001 |
| 926.22 | -0.001 |
| 926.47 | -0.002 |
| 926.71 | -0.001 |
| 926.95 | 0.001 |
| 927.19 | -0.001 |
| 927.43 | 0.002 |
| 927.67 | -0.001 |
| 927.91 | -0.001 |
| 928.15 | -0.002 |
| 928.4 | 0.001 |
| 928.64 | -0.001 |
| 928.88 | 0.003 |
| 929.12 | -0.001 |
| 929.36 | 0 |
| 929.6 | 0 |
| 929.84 | 0.001 |
| 930.08 | -0.001 |
| 930.32 | 0.001 |
| 930.57 | -0.001 |
| 930.81 | -0.001 |
| 931.05 | -0.001 |
| 931.29 | 0.001 |
| 931.53 | 0 |
| 931.77 | 0.001 |
| 932.01 | 0 |
| 932.25 | 0.002 |
| 932.5 | 0.002 |
| 932.74 | 0.001 |
| 932.98 | 0 |
| 933.22 | -0.001 |
| 933.46 | -0.001 |
| 933.7 | 0 |
| 933.94 | 0 |
| 934.18 | 0.001 |
| 934.43 | 0.002 |
| 934.67 | 0 |
| 934.91 | 0 |
| 935.15 | 0.001 |
| 935.39 | 0.001 |
| 935.63 | -0.001 |
| 935.87 | -0.001 |
| 936.12 | -0.001 |
| 936.36 | -0.001 |
| 936.6 | 0.001 |
| 936.84 | -0.001 |
| 937.08 | 0 |
| 937.32 | 0 |
| 937.56 | 0 |
| 937.8 | 0 |
| 938.05 | 0.001 |
| 938.29 | 0 |
| 938.53 | 0 |
| 938.77 | -0.001 |
| 939.01 | -0.001 |
| 939.25 | -0.001 |
| 939.49 | 0 |
| 939.74 | 0 |
| 939.98 | 0.001 |
| 940.22 | -0.001 |
| 940.46 | 0.001 |
| 940.7 | 0 |
| 940.94 | -0.001 |
| 941.18 | 0 |
| 941.43 | -0.001 |
| 941.67 | 0 |
| 941.91 | -0.001 |
| 942.15 | 0.001 |
| 942.39 | 0 |
| 942.63 | 0.001 |
| 942.87 | -0.001 |
| 943.12 | 0.001 |
| 943.36 | -0.001 |
| 943.6 | 0 |
| 943.84 | -0.003 |
| 944.08 | 0 |
| 944.32 | -0.003 |
| 944.57 | -0.003 |
| 944.81 | -0.001 |
| 945.05 | 0 |
| 945.29 | -0.002 |
| 945.53 | 0 |
| 945.77 | 0 |
| 946.01 | 0.002 |
| 946.26 | -0.003 |
| 946.5 | 0.003 |
| 946.74 | 0 |
| 946.98 | 0 |
| 947.22 | -0.002 |
| 947.46 | -0.001 |
| 947.71 | -0.001 |
| 947.95 | 0.001 |
| 948.19 | -0.002 |
| 948.43 | 0.001 |
| 948.67 | 0 |
| 948.91 | 0 |
| 949.16 | 0.002 |
| 949.4 | 0 |
| 949.64 | -0.003 |
| 949.88 | 0 |
| 950.12 | 0 |
| 950.36 | 0.001 |
| 950.61 | 0 |
| 950.85 | 0 |
| 951.09 | 0 |
| 951.33 | 0 |
| 951.57 | 0 |
| 951.81 | 0.002 |
| 952.06 | -0.001 |
| 952.3 | -0.001 |
| 952.54 | 0 |
| 952.78 | 0.001 |
| 953.02 | -0.001 |
| 953.26 | 0 |
| 953.51 | -0.002 |
| 953.75 | 0 |
| 953.99 | 0 |
| 954.23 | 0 |
| 954.47 | -0.001 |
| 954.71 | 0 |
| 954.96 | 0 |
| 955.2 | 0 |
| 955.44 | 0 |
| 955.68 | 0.001 |
| 955.92 | -0.002 |
| 956.16 | 0.001 |
| 956.41 | 0 |
| 956.65 | -0.001 |
| 956.89 | -0.003 |
| 957.13 | 0.001 |
| 957.37 | -0.001 |
| 957.62 | 0.003 |
| 957.86 | 0.002 |
| 958.1 | 0.001 |
| 958.34 | -0.002 |
| 958.58 | 0 |
| 958.82 | 0 |
| 959.07 | -0.001 |
| 959.31 | 0.001 |
| 959.55 | 0.002 |
| 959.79 | -0.001 |
| 960.03 | 0.001 |
| 960.28 | 0 |
| 960.52 | 0 |
| 960.76 | 0 |
| 961.0 | 0.001 |
| 961.24 | -0.001 |
| 961.48 | 0.002 |
| 961.73 | -0.001 |
| 961.97 | 0.001 |
| 962.21 | -0.001 |
| 962.45 | 0 |
| 962.69 | 0 |
| 962.94 | -0.001 |
| 963.18 | -0.001 |
| 963.42 | 0.002 |
| 963.66 | 0 |
| 963.9 | 0 |
| 964.15 | -0.001 |
| 964.39 | 0.001 |
| 964.63 | -0.001 |
| 964.87 | -0.002 |
| 965.11 | -0.001 |
| 965.36 | 0.001 |
| 965.6 | -0.001 |
| 965.84 | -0.001 |
| 966.08 | -0.001 |
| 966.32 | -0.001 |
| 966.57 | 0.001 |
| 966.81 | -0.001 |
| 967.05 | -0.001 |
| 967.29 | 0.001 |
| 967.53 | 0 |
| 967.77 | -0.001 |
| 968.02 | 0.001 |
| 968.26 | 0.001 |
| 968.5 | 0 |
| 968.74 | 0 |
| 968.99 | -0.001 |
| 969.23 | 0.003 |
| 969.47 | -0.002 |
| 969.71 | 0 |
| 969.95 | -0.001 |
| 970.2 | -0.001 |
| 970.44 | -0.001 |
| 970.68 | -0.002 |
| 970.92 | 0 |
| 971.16 | 0 |
| 971.41 | 0 |
| 971.65 | 0 |
| 971.89 | 0.001 |
| 972.13 | 0 |
| 972.37 | 0.001 |
| 972.62 | 0.001 |
| 972.86 | -0.002 |
| 973.1 | -0.001 |
| 973.34 | -0.002 |
| 973.58 | 0.001 |
| 973.83 | 0 |
| 974.07 | 0 |
| 974.31 | -0.003 |
| 974.55 | 0 |
| 974.8 | -0.001 |
| 975.04 | 0.001 |
| 975.28 | 0 |
| 975.52 | 0 |
| 975.76 | -0.001 |
| 976.01 | 0.001 |
| 976.25 | 0.001 |
| 976.49 | -0.001 |
| 976.73 | 0 |
| 976.97 | -0.002 |
| 977.22 | -0.001 |
| 977.46 | 0.001 |
| 977.7 | -0.001 |
| 977.94 | 0 |
| 978.19 | -0.001 |
| 978.43 | 0 |
| 978.67 | 0 |
| 978.91 | 0.001 |
| 979.15 | 0.001 |
| 979.4 | -0.001 |
| 979.64 | 0 |
| 979.88 | 0.001 |
| 980.12 | 0 |
| 980.37 | -0.002 |
| 980.61 | 0 |
| 980.85 | 0.002 |
| 981.09 | -0.001 |
| 981.33 | 0.001 |
| 981.58 | -0.002 |
| 981.82 | 0.001 |
| 982.06 | -0.001 |
| 982.3 | 0 |
| 982.55 | 0.001 |
| 982.79 | 0 |
| 983.03 | -0.001 |
| 983.27 | 0 |
| 983.52 | -0.002 |
| 983.76 | 0 |
| 984.0 | 0.001 |
| 984.24 | 0.001 |
| 984.48 | -0.001 |
| 984.73 | -0.002 |
| 984.97 | 0 |
| 985.21 | 0.003 |
| 985.45 | -0.002 |
| 985.7 | -0.001 |
| 985.94 | -0.002 |
| 986.18 | 0.002 |
| 986.42 | 0 |
| 986.67 | 0.001 |
| 986.91 | -0.002 |
| 987.15 | -0.001 |
| 987.39 | -0.003 |
| 987.63 | 0 |
| 987.88 | -0.001 |
| 988.12 | 0 |
| 988.36 | 0.001 |
| 988.6 | 0 |
| 988.85 | -0.002 |
| 989.09 | 0.003 |
| 989.33 | -0.001 |
| 989.57 | 0.001 |
| 989.82 | 0 |
| 990.06 | 0.002 |
| 990.3 | -0.002 |
| 990.54 | 0 |
| 990.79 | -0.001 |
| 991.03 | 0 |
| 991.27 | -0.001 |
| 991.51 | 0 |
| 991.76 | -0.002 |
| 992.0 | 0 |
| 992.24 | -0.001 |
| 992.48 | 0.001 |
| 992.73 | 0 |
| 992.97 | -0.002 |
| 993.21 | 0 |
| 993.45 | -0.001 |
| 993.7 | 0.002 |
| 993.94 | 0 |
| 994.18 | -0.001 |
| 994.42 | 0.001 |
| 994.67 | 0.001 |
| 994.91 | 0 |
| 995.15 | 0 |
| 995.39 | 0 |
| 995.64 | 0.001 |
| 995.88 | -0.001 |
| 996.12 | 0 |
| 996.36 | 0.001 |
| 996.61 | -0.002 |
| 996.85 | 0 |
| 997.09 | 0.001 |
| 997.33 | -0.002 |
| 997.58 | 0.001 |
| 997.82 | 0.002 |
| 998.06 | 0 |
| 998.3 | 0 |
| 998.55 | -0.002 |
| 998.79 | -0.001 |
| 999.03 | 0.001 |
| 999.27 | 0.001 |
| 999.52 | 0 |
| 999.76 | -0.001 |
| 1000.0 | 0.002 |
| 1000.2 | 0 |
| 1000.5 | 0.001 |
| 1000.7 | 0 |
| 1001.0 | 0 |
| 1001.2 | 0 |
| 1001.5 | 0.002 |
| 1001.7 | -0.003 |
| 1001.9 | 0.003 |
| 1002.2 | 0 |
| 1002.4 | 0 |
| 1002.7 | 0 |
| 1002.9 | 0 |
| 1003.2 | -0.003 |
| 1003.4 | 0.002 |
| 1003.6 | -0.001 |
| 1003.9 | -0.001 |
| 1004.1 | 0 |
| 1004.4 | 0.001 |
| 1004.6 | 0.001 |
| 1004.9 | 0.002 |
| 1005.1 | 0 |
| 1005.3 | 0.001 |
| 1005.6 | 0.001 |
| 1005.8 | -0.001 |
| 1006.1 | -0.001 |
| 1006.3 | 0.002 |
| 1006.6 | -0.002 |
| 1006.8 | 0 |
| 1007.0 | 0 |
| 1007.3 | 0.001 |
| 1007.5 | -0.003 |
| 1007.8 | 0 |
| 1008.0 | 0 |
| 1008.3 | 0 |
| 1008.5 | -0.001 |
| 1008.7 | 0 |
| 1009.0 | 0.001 |
| 1009.2 | 0.001 |
| 1009.5 | 0.001 |
| 1009.7 | 0.001 |
| 1010.0 | -0.001 |
| 1010.2 | 0 |
| 1010.4 | 0.001 |
| 1010.7 | 0 |
| 1010.9 | 0 |
| 1011.2 | 0.001 |
| 1011.4 | 0 |
| 1011.7 | -0.001 |
| 1011.9 | 0 |
| 1012.1 | 0 |
| 1012.4 | 0 |
| 1012.6 | 0.001 |
| 1012.9 | 0 |
| 1013.1 | 0.002 |
| 1013.4 | 0 |
| 1013.6 | 0 |
| 1013.8 | 0.001 |
| 1014.1 | 0.001 |
| 1014.3 | 0.001 |
| 1014.6 | 0.001 |
| 1014.8 | 0.001 |
| 1015.1 | -0.002 |
| 1015.3 | -0.001 |
| 1015.5 | 0.003 |
| 1015.8 | 0.001 |
| 1016.0 | 0.002 |
| 1016.3 | 0 |
| 1016.5 | 0.001 |
| 1016.8 | -0.003 |
| 1017.0 | 0.001 |
| 1017.2 | 0 |
| 1017.5 | -0.001 |
| 1017.7 | 0.003 |
| 1018.0 | -0.001 |
| 1018.2 | -0.001 |
| 1018.5 | 0.001 |
| 1018.7 | -0.001 |
| 1018.9 | 0.003 |
| 1019.2 | -0.001 |
| 1019.4 | 0 |
| 1019.7 | 0.001 |
| 1019.9 | 0 |
| 1020.2 | 0 |
| 1020.4 | 0 |
| 1020.6 | -0.001 |
| 1020.9 | 0.001 |
| 1021.1 | -0.002 |
| 1021.4 | 0 |
| 1021.6 | -0.002 |
| 1021.9 | 0 |